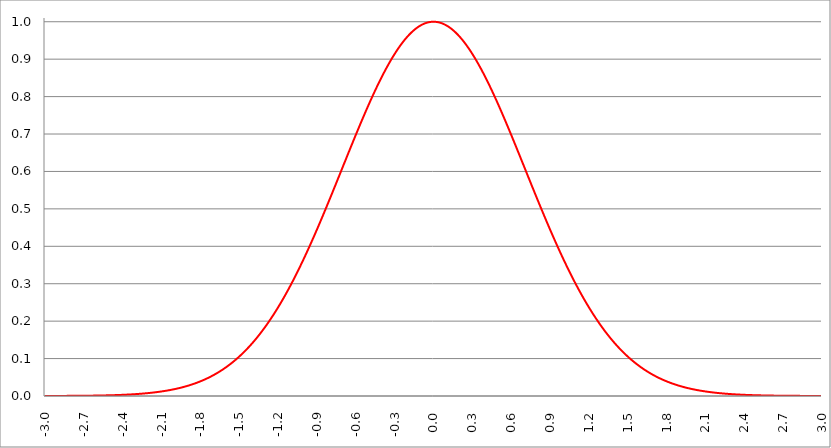
| Category | Series 1 | Series 0 | Series 2 |
|---|---|---|---|
| -3.0 | 0 |  |  |
| -2.997 | 0 |  |  |
| -2.994 | 0 |  |  |
| -2.991 | 0 |  |  |
| -2.988 | 0 |  |  |
| -2.984999999999999 | 0 |  |  |
| -2.981999999999999 | 0 |  |  |
| -2.978999999999999 | 0 |  |  |
| -2.975999999999999 | 0 |  |  |
| -2.972999999999999 | 0 |  |  |
| -2.969999999999999 | 0 |  |  |
| -2.966999999999999 | 0 |  |  |
| -2.963999999999999 | 0 |  |  |
| -2.960999999999998 | 0 |  |  |
| -2.957999999999998 | 0 |  |  |
| -2.954999999999998 | 0 |  |  |
| -2.951999999999998 | 0 |  |  |
| -2.948999999999998 | 0 |  |  |
| -2.945999999999998 | 0 |  |  |
| -2.942999999999998 | 0 |  |  |
| -2.939999999999998 | 0 |  |  |
| -2.936999999999998 | 0 |  |  |
| -2.933999999999997 | 0 |  |  |
| -2.930999999999997 | 0 |  |  |
| -2.927999999999997 | 0 |  |  |
| -2.924999999999997 | 0 |  |  |
| -2.921999999999997 | 0 |  |  |
| -2.918999999999997 | 0 |  |  |
| -2.915999999999997 | 0 |  |  |
| -2.912999999999997 | 0 |  |  |
| -2.909999999999997 | 0 |  |  |
| -2.906999999999996 | 0 |  |  |
| -2.903999999999996 | 0 |  |  |
| -2.900999999999996 | 0 |  |  |
| -2.897999999999996 | 0 |  |  |
| -2.894999999999996 | 0 |  |  |
| -2.891999999999996 | 0 |  |  |
| -2.888999999999996 | 0 |  |  |
| -2.885999999999996 | 0 |  |  |
| -2.882999999999996 | 0 |  |  |
| -2.879999999999995 | 0 |  |  |
| -2.876999999999995 | 0 |  |  |
| -2.873999999999995 | 0 |  |  |
| -2.870999999999995 | 0 |  |  |
| -2.867999999999995 | 0 |  |  |
| -2.864999999999995 | 0 |  |  |
| -2.861999999999995 | 0 |  |  |
| -2.858999999999995 | 0 |  |  |
| -2.855999999999994 | 0 |  |  |
| -2.852999999999994 | 0 |  |  |
| -2.849999999999994 | 0 |  |  |
| -2.846999999999994 | 0 |  |  |
| -2.843999999999994 | 0 |  |  |
| -2.840999999999994 | 0 |  |  |
| -2.837999999999994 | 0 |  |  |
| -2.834999999999994 | 0 |  |  |
| -2.831999999999994 | 0 |  |  |
| -2.828999999999993 | 0 |  |  |
| -2.825999999999993 | 0 |  |  |
| -2.822999999999993 | 0 |  |  |
| -2.819999999999993 | 0 |  |  |
| -2.816999999999993 | 0 |  |  |
| -2.813999999999993 | 0 |  |  |
| -2.810999999999993 | 0 |  |  |
| -2.807999999999993 | 0 |  |  |
| -2.804999999999993 | 0 |  |  |
| -2.801999999999992 | 0 |  |  |
| -2.798999999999992 | 0 |  |  |
| -2.795999999999992 | 0 |  |  |
| -2.792999999999992 | 0 |  |  |
| -2.789999999999992 | 0 |  |  |
| -2.786999999999992 | 0 |  |  |
| -2.783999999999992 | 0 |  |  |
| -2.780999999999992 | 0 |  |  |
| -2.777999999999992 | 0 |  |  |
| -2.774999999999991 | 0 |  |  |
| -2.771999999999991 | 0 |  |  |
| -2.768999999999991 | 0 |  |  |
| -2.765999999999991 | 0 |  |  |
| -2.762999999999991 | 0 |  |  |
| -2.759999999999991 | 0 |  |  |
| -2.756999999999991 | 0 |  |  |
| -2.753999999999991 | 0.001 |  |  |
| -2.75099999999999 | 0.001 |  |  |
| -2.74799999999999 | 0.001 |  |  |
| -2.74499999999999 | 0.001 |  |  |
| -2.74199999999999 | 0.001 |  |  |
| -2.73899999999999 | 0.001 |  |  |
| -2.73599999999999 | 0.001 |  |  |
| -2.73299999999999 | 0.001 |  |  |
| -2.72999999999999 | 0.001 |  |  |
| -2.72699999999999 | 0.001 |  |  |
| -2.723999999999989 | 0.001 |  |  |
| -2.720999999999989 | 0.001 |  |  |
| -2.717999999999989 | 0.001 |  |  |
| -2.714999999999989 | 0.001 |  |  |
| -2.711999999999989 | 0.001 |  |  |
| -2.708999999999989 | 0.001 |  |  |
| -2.705999999999989 | 0.001 |  |  |
| -2.702999999999989 | 0.001 |  |  |
| -2.699999999999989 | 0.001 |  |  |
| -2.696999999999988 | 0.001 |  |  |
| -2.693999999999988 | 0.001 |  |  |
| -2.690999999999988 | 0.001 |  |  |
| -2.687999999999988 | 0.001 |  |  |
| -2.684999999999988 | 0.001 |  |  |
| -2.681999999999988 | 0.001 |  |  |
| -2.678999999999988 | 0.001 |  |  |
| -2.675999999999988 | 0.001 |  |  |
| -2.672999999999988 | 0.001 |  |  |
| -2.669999999999987 | 0.001 |  |  |
| -2.666999999999987 | 0.001 |  |  |
| -2.663999999999987 | 0.001 |  |  |
| -2.660999999999987 | 0.001 |  |  |
| -2.657999999999987 | 0.001 |  |  |
| -2.654999999999987 | 0.001 |  |  |
| -2.651999999999987 | 0.001 |  |  |
| -2.648999999999987 | 0.001 |  |  |
| -2.645999999999986 | 0.001 |  |  |
| -2.642999999999986 | 0.001 |  |  |
| -2.639999999999986 | 0.001 |  |  |
| -2.636999999999986 | 0.001 |  |  |
| -2.633999999999986 | 0.001 |  |  |
| -2.630999999999986 | 0.001 |  |  |
| -2.627999999999986 | 0.001 |  |  |
| -2.624999999999986 | 0.001 |  |  |
| -2.621999999999986 | 0.001 |  |  |
| -2.618999999999985 | 0.001 |  |  |
| -2.615999999999985 | 0.001 |  |  |
| -2.612999999999985 | 0.001 |  |  |
| -2.609999999999985 | 0.001 |  |  |
| -2.606999999999985 | 0.001 |  |  |
| -2.603999999999985 | 0.001 |  |  |
| -2.600999999999985 | 0.001 |  |  |
| -2.597999999999985 | 0.001 |  |  |
| -2.594999999999985 | 0.001 |  |  |
| -2.591999999999985 | 0.001 |  |  |
| -2.588999999999984 | 0.001 |  |  |
| -2.585999999999984 | 0.001 |  |  |
| -2.582999999999984 | 0.001 |  |  |
| -2.579999999999984 | 0.001 |  |  |
| -2.576999999999984 | 0.001 |  |  |
| -2.573999999999984 | 0.001 |  |  |
| -2.570999999999984 | 0.001 |  |  |
| -2.567999999999984 | 0.001 |  |  |
| -2.564999999999984 | 0.001 |  |  |
| -2.561999999999983 | 0.001 |  |  |
| -2.558999999999983 | 0.001 |  |  |
| -2.555999999999983 | 0.001 |  |  |
| -2.552999999999983 | 0.001 |  |  |
| -2.549999999999983 | 0.001 |  |  |
| -2.546999999999983 | 0.002 |  |  |
| -2.543999999999983 | 0.002 |  |  |
| -2.540999999999983 | 0.002 |  |  |
| -2.537999999999982 | 0.002 |  |  |
| -2.534999999999982 | 0.002 |  |  |
| -2.531999999999982 | 0.002 |  |  |
| -2.528999999999982 | 0.002 |  |  |
| -2.525999999999982 | 0.002 |  |  |
| -2.522999999999982 | 0.002 |  |  |
| -2.519999999999982 | 0.002 |  |  |
| -2.516999999999982 | 0.002 |  |  |
| -2.513999999999982 | 0.002 |  |  |
| -2.510999999999981 | 0.002 |  |  |
| -2.507999999999981 | 0.002 |  |  |
| -2.504999999999981 | 0.002 |  |  |
| -2.501999999999981 | 0.002 |  |  |
| -2.498999999999981 | 0.002 |  |  |
| -2.495999999999981 | 0.002 |  |  |
| -2.492999999999981 | 0.002 |  |  |
| -2.489999999999981 | 0.002 |  |  |
| -2.486999999999981 | 0.002 |  |  |
| -2.48399999999998 | 0.002 |  |  |
| -2.48099999999998 | 0.002 |  |  |
| -2.47799999999998 | 0.002 |  |  |
| -2.47499999999998 | 0.002 |  |  |
| -2.47199999999998 | 0.002 |  |  |
| -2.46899999999998 | 0.002 |  |  |
| -2.46599999999998 | 0.002 |  |  |
| -2.46299999999998 | 0.002 |  |  |
| -2.45999999999998 | 0.002 |  |  |
| -2.456999999999979 | 0.002 |  |  |
| -2.453999999999979 | 0.002 |  |  |
| -2.450999999999979 | 0.002 |  |  |
| -2.44799999999998 | 0.002 |  |  |
| -2.444999999999979 | 0.003 |  |  |
| -2.441999999999979 | 0.003 |  |  |
| -2.438999999999979 | 0.003 |  |  |
| -2.435999999999979 | 0.003 |  |  |
| -2.432999999999978 | 0.003 |  |  |
| -2.429999999999978 | 0.003 |  |  |
| -2.426999999999978 | 0.003 |  |  |
| -2.423999999999978 | 0.003 |  |  |
| -2.420999999999978 | 0.003 |  |  |
| -2.417999999999978 | 0.003 |  |  |
| -2.414999999999978 | 0.003 |  |  |
| -2.411999999999978 | 0.003 |  |  |
| -2.408999999999978 | 0.003 |  |  |
| -2.405999999999977 | 0.003 |  |  |
| -2.402999999999977 | 0.003 |  |  |
| -2.399999999999977 | 0.003 |  |  |
| -2.396999999999977 | 0.003 |  |  |
| -2.393999999999977 | 0.003 |  |  |
| -2.390999999999977 | 0.003 |  |  |
| -2.387999999999977 | 0.003 |  |  |
| -2.384999999999977 | 0.003 |  |  |
| -2.381999999999977 | 0.003 |  |  |
| -2.378999999999976 | 0.003 |  |  |
| -2.375999999999976 | 0.004 |  |  |
| -2.372999999999976 | 0.004 |  |  |
| -2.369999999999976 | 0.004 |  |  |
| -2.366999999999976 | 0.004 |  |  |
| -2.363999999999976 | 0.004 |  |  |
| -2.360999999999976 | 0.004 |  |  |
| -2.357999999999976 | 0.004 |  |  |
| -2.354999999999976 | 0.004 |  |  |
| -2.351999999999975 | 0.004 |  |  |
| -2.348999999999975 | 0.004 |  |  |
| -2.345999999999975 | 0.004 |  |  |
| -2.342999999999975 | 0.004 |  |  |
| -2.339999999999975 | 0.004 |  |  |
| -2.336999999999975 | 0.004 |  |  |
| -2.333999999999975 | 0.004 |  |  |
| -2.330999999999975 | 0.004 |  |  |
| -2.327999999999974 | 0.004 |  |  |
| -2.324999999999974 | 0.004 |  |  |
| -2.321999999999974 | 0.005 |  |  |
| -2.318999999999974 | 0.005 |  |  |
| -2.315999999999974 | 0.005 |  |  |
| -2.312999999999974 | 0.005 |  |  |
| -2.309999999999974 | 0.005 |  |  |
| -2.306999999999974 | 0.005 |  |  |
| -2.303999999999974 | 0.005 |  |  |
| -2.300999999999973 | 0.005 |  |  |
| -2.297999999999973 | 0.005 |  |  |
| -2.294999999999973 | 0.005 |  |  |
| -2.291999999999973 | 0.005 |  |  |
| -2.288999999999973 | 0.005 |  |  |
| -2.285999999999973 | 0.005 |  |  |
| -2.282999999999973 | 0.005 |  |  |
| -2.279999999999973 | 0.006 |  |  |
| -2.276999999999973 | 0.006 |  |  |
| -2.273999999999972 | 0.006 |  |  |
| -2.270999999999972 | 0.006 |  |  |
| -2.267999999999972 | 0.006 |  |  |
| -2.264999999999972 | 0.006 |  |  |
| -2.261999999999972 | 0.006 |  |  |
| -2.258999999999972 | 0.006 |  |  |
| -2.255999999999972 | 0.006 |  |  |
| -2.252999999999972 | 0.006 |  |  |
| -2.249999999999972 | 0.006 |  |  |
| -2.246999999999971 | 0.006 |  |  |
| -2.243999999999971 | 0.007 |  |  |
| -2.240999999999971 | 0.007 |  |  |
| -2.237999999999971 | 0.007 |  |  |
| -2.234999999999971 | 0.007 |  |  |
| -2.231999999999971 | 0.007 |  |  |
| -2.228999999999971 | 0.007 |  |  |
| -2.225999999999971 | 0.007 |  |  |
| -2.222999999999971 | 0.007 |  |  |
| -2.21999999999997 | 0.007 |  |  |
| -2.21699999999997 | 0.007 |  |  |
| -2.21399999999997 | 0.007 |  |  |
| -2.21099999999997 | 0.008 |  |  |
| -2.20799999999997 | 0.008 |  |  |
| -2.20499999999997 | 0.008 |  |  |
| -2.20199999999997 | 0.008 |  |  |
| -2.19899999999997 | 0.008 |  |  |
| -2.19599999999997 | 0.008 |  |  |
| -2.192999999999969 | 0.008 |  |  |
| -2.189999999999969 | 0.008 |  |  |
| -2.186999999999969 | 0.008 |  |  |
| -2.18399999999997 | 0.008 |  |  |
| -2.180999999999969 | 0.009 |  |  |
| -2.177999999999969 | 0.009 |  |  |
| -2.174999999999969 | 0.009 |  |  |
| -2.171999999999969 | 0.009 |  |  |
| -2.168999999999968 | 0.009 |  |  |
| -2.165999999999968 | 0.009 |  |  |
| -2.162999999999968 | 0.009 |  |  |
| -2.159999999999968 | 0.009 |  |  |
| -2.156999999999968 | 0.01 |  |  |
| -2.153999999999968 | 0.01 |  |  |
| -2.150999999999968 | 0.01 |  |  |
| -2.147999999999968 | 0.01 |  |  |
| -2.144999999999968 | 0.01 |  |  |
| -2.141999999999967 | 0.01 |  |  |
| -2.138999999999967 | 0.01 |  |  |
| -2.135999999999967 | 0.01 |  |  |
| -2.132999999999967 | 0.011 |  |  |
| -2.129999999999967 | 0.011 |  |  |
| -2.126999999999967 | 0.011 |  |  |
| -2.123999999999967 | 0.011 |  |  |
| -2.120999999999967 | 0.011 |  |  |
| -2.117999999999967 | 0.011 |  |  |
| -2.114999999999966 | 0.011 |  |  |
| -2.111999999999966 | 0.012 |  |  |
| -2.108999999999966 | 0.012 |  |  |
| -2.105999999999966 | 0.012 |  |  |
| -2.102999999999966 | 0.012 |  |  |
| -2.099999999999966 | 0.012 |  |  |
| -2.096999999999966 | 0.012 |  |  |
| -2.093999999999966 | 0.012 |  |  |
| -2.090999999999966 | 0.013 |  |  |
| -2.087999999999965 | 0.013 |  |  |
| -2.084999999999965 | 0.013 |  |  |
| -2.081999999999965 | 0.013 |  |  |
| -2.078999999999965 | 0.013 |  |  |
| -2.075999999999965 | 0.013 |  |  |
| -2.072999999999965 | 0.014 |  |  |
| -2.069999999999965 | 0.014 |  |  |
| -2.066999999999965 | 0.014 |  |  |
| -2.063999999999965 | 0.014 |  |  |
| -2.060999999999964 | 0.014 |  |  |
| -2.057999999999964 | 0.014 |  |  |
| -2.054999999999964 | 0.015 |  |  |
| -2.051999999999964 | 0.015 |  |  |
| -2.048999999999964 | 0.015 |  |  |
| -2.045999999999964 | 0.015 |  |  |
| -2.042999999999964 | 0.015 |  |  |
| -2.039999999999964 | 0.016 |  |  |
| -2.036999999999963 | 0.016 |  |  |
| -2.033999999999963 | 0.016 |  |  |
| -2.030999999999963 | 0.016 |  |  |
| -2.027999999999963 | 0.016 |  |  |
| -2.024999999999963 | 0.017 |  |  |
| -2.021999999999963 | 0.017 |  |  |
| -2.018999999999963 | 0.017 |  |  |
| -2.015999999999963 | 0.017 |  |  |
| -2.012999999999963 | 0.017 |  |  |
| -2.009999999999962 | 0.018 |  |  |
| -2.006999999999962 | 0.018 |  |  |
| -2.003999999999962 | 0.018 |  |  |
| -2.000999999999962 | 0.018 |  |  |
| -1.997999999999962 | 0.018 |  |  |
| -1.994999999999962 | 0.019 |  |  |
| -1.991999999999962 | 0.019 |  |  |
| -1.988999999999963 | 0.019 |  |  |
| -1.985999999999963 | 0.019 |  |  |
| -1.982999999999963 | 0.02 |  |  |
| -1.979999999999963 | 0.02 |  |  |
| -1.976999999999963 | 0.02 |  |  |
| -1.973999999999963 | 0.02 |  |  |
| -1.970999999999963 | 0.021 |  |  |
| -1.967999999999963 | 0.021 |  |  |
| -1.964999999999963 | 0.021 |  |  |
| -1.961999999999964 | 0.021 |  |  |
| -1.958999999999964 | 0.022 |  |  |
| -1.955999999999964 | 0.022 |  |  |
| -1.952999999999964 | 0.022 |  |  |
| -1.949999999999964 | 0.022 |  |  |
| -1.946999999999964 | 0.023 |  |  |
| -1.943999999999964 | 0.023 |  |  |
| -1.940999999999964 | 0.023 |  |  |
| -1.937999999999964 | 0.023 |  |  |
| -1.934999999999964 | 0.024 |  |  |
| -1.931999999999965 | 0.024 |  |  |
| -1.928999999999965 | 0.024 |  |  |
| -1.925999999999965 | 0.024 |  |  |
| -1.922999999999965 | 0.025 |  |  |
| -1.919999999999965 | 0.025 |  |  |
| -1.916999999999965 | 0.025 |  |  |
| -1.913999999999965 | 0.026 |  |  |
| -1.910999999999965 | 0.026 |  |  |
| -1.907999999999965 | 0.026 |  |  |
| -1.904999999999966 | 0.027 |  |  |
| -1.901999999999966 | 0.027 |  |  |
| -1.898999999999966 | 0.027 |  |  |
| -1.895999999999966 | 0.027 |  |  |
| -1.892999999999966 | 0.028 |  |  |
| -1.889999999999966 | 0.028 |  |  |
| -1.886999999999966 | 0.028 |  |  |
| -1.883999999999966 | 0.029 |  |  |
| -1.880999999999966 | 0.029 |  |  |
| -1.877999999999967 | 0.029 |  |  |
| -1.874999999999967 | 0.03 |  |  |
| -1.871999999999967 | 0.03 |  |  |
| -1.868999999999967 | 0.03 |  |  |
| -1.865999999999967 | 0.031 |  |  |
| -1.862999999999967 | 0.031 |  |  |
| -1.859999999999967 | 0.031 |  |  |
| -1.856999999999967 | 0.032 |  |  |
| -1.853999999999967 | 0.032 |  |  |
| -1.850999999999968 | 0.033 |  |  |
| -1.847999999999968 | 0.033 |  |  |
| -1.844999999999968 | 0.033 |  |  |
| -1.841999999999968 | 0.034 |  |  |
| -1.838999999999968 | 0.034 |  |  |
| -1.835999999999968 | 0.034 |  |  |
| -1.832999999999968 | 0.035 |  |  |
| -1.829999999999968 | 0.035 |  |  |
| -1.826999999999968 | 0.036 |  |  |
| -1.823999999999968 | 0.036 |  |  |
| -1.820999999999969 | 0.036 |  |  |
| -1.817999999999969 | 0.037 |  |  |
| -1.814999999999969 | 0.037 |  |  |
| -1.811999999999969 | 0.038 |  |  |
| -1.808999999999969 | 0.038 |  |  |
| -1.805999999999969 | 0.038 |  |  |
| -1.802999999999969 | 0.039 |  |  |
| -1.799999999999969 | 0.039 |  |  |
| -1.796999999999969 | 0.04 |  |  |
| -1.79399999999997 | 0.04 |  |  |
| -1.79099999999997 | 0.04 |  |  |
| -1.78799999999997 | 0.041 |  |  |
| -1.78499999999997 | 0.041 |  |  |
| -1.78199999999997 | 0.042 |  |  |
| -1.77899999999997 | 0.042 |  |  |
| -1.77599999999997 | 0.043 |  |  |
| -1.77299999999997 | 0.043 |  |  |
| -1.76999999999997 | 0.044 |  |  |
| -1.766999999999971 | 0.044 |  |  |
| -1.763999999999971 | 0.045 |  |  |
| -1.760999999999971 | 0.045 |  |  |
| -1.757999999999971 | 0.045 |  |  |
| -1.754999999999971 | 0.046 |  |  |
| -1.751999999999971 | 0.046 |  |  |
| -1.748999999999971 | 0.047 |  |  |
| -1.745999999999971 | 0.047 |  |  |
| -1.742999999999971 | 0.048 |  |  |
| -1.739999999999971 | 0.048 |  |  |
| -1.736999999999972 | 0.049 |  |  |
| -1.733999999999972 | 0.049 |  |  |
| -1.730999999999972 | 0.05 |  |  |
| -1.727999999999972 | 0.05 |  |  |
| -1.724999999999972 | 0.051 |  |  |
| -1.721999999999972 | 0.052 |  |  |
| -1.718999999999972 | 0.052 |  |  |
| -1.715999999999972 | 0.053 |  |  |
| -1.712999999999972 | 0.053 |  |  |
| -1.709999999999973 | 0.054 |  |  |
| -1.706999999999973 | 0.054 |  |  |
| -1.703999999999973 | 0.055 |  |  |
| -1.700999999999973 | 0.055 |  |  |
| -1.697999999999973 | 0.056 |  |  |
| -1.694999999999973 | 0.057 |  |  |
| -1.691999999999973 | 0.057 |  |  |
| -1.688999999999973 | 0.058 |  |  |
| -1.685999999999973 | 0.058 |  |  |
| -1.682999999999974 | 0.059 |  |  |
| -1.679999999999974 | 0.059 |  |  |
| -1.676999999999974 | 0.06 |  |  |
| -1.673999999999974 | 0.061 |  |  |
| -1.670999999999974 | 0.061 |  |  |
| -1.667999999999974 | 0.062 |  |  |
| -1.664999999999974 | 0.063 |  |  |
| -1.661999999999974 | 0.063 |  |  |
| -1.658999999999974 | 0.064 |  |  |
| -1.655999999999975 | 0.064 |  |  |
| -1.652999999999975 | 0.065 |  |  |
| -1.649999999999975 | 0.066 |  |  |
| -1.646999999999975 | 0.066 |  |  |
| -1.643999999999975 | 0.067 |  |  |
| -1.640999999999975 | 0.068 |  |  |
| -1.637999999999975 | 0.068 |  |  |
| -1.634999999999975 | 0.069 |  |  |
| -1.631999999999975 | 0.07 |  |  |
| -1.628999999999975 | 0.07 |  |  |
| -1.625999999999976 | 0.071 |  |  |
| -1.622999999999976 | 0.072 |  |  |
| -1.619999999999976 | 0.072 |  |  |
| -1.616999999999976 | 0.073 |  |  |
| -1.613999999999976 | 0.074 |  |  |
| -1.610999999999976 | 0.075 |  |  |
| -1.607999999999976 | 0.075 |  |  |
| -1.604999999999976 | 0.076 |  |  |
| -1.601999999999976 | 0.077 |  |  |
| -1.598999999999977 | 0.078 |  |  |
| -1.595999999999977 | 0.078 |  |  |
| -1.592999999999977 | 0.079 |  |  |
| -1.589999999999977 | 0.08 |  |  |
| -1.586999999999977 | 0.081 |  |  |
| -1.583999999999977 | 0.081 |  |  |
| -1.580999999999977 | 0.082 |  |  |
| -1.577999999999977 | 0.083 |  |  |
| -1.574999999999978 | 0.084 |  |  |
| -1.571999999999978 | 0.084 |  |  |
| -1.568999999999978 | 0.085 |  |  |
| -1.565999999999978 | 0.086 |  |  |
| -1.562999999999978 | 0.087 |  |  |
| -1.559999999999978 | 0.088 |  |  |
| -1.556999999999978 | 0.089 |  |  |
| -1.553999999999978 | 0.089 |  |  |
| -1.550999999999978 | 0.09 |  |  |
| -1.547999999999978 | 0.091 |  |  |
| -1.544999999999979 | 0.092 |  |  |
| -1.541999999999979 | 0.093 |  |  |
| -1.538999999999979 | 0.094 |  |  |
| -1.535999999999979 | 0.094 |  |  |
| -1.532999999999979 | 0.095 |  |  |
| -1.529999999999979 | 0.096 |  |  |
| -1.526999999999979 | 0.097 |  |  |
| -1.523999999999979 | 0.098 |  |  |
| -1.520999999999979 | 0.099 |  |  |
| -1.51799999999998 | 0.1 |  |  |
| -1.51499999999998 | 0.101 |  |  |
| -1.51199999999998 | 0.102 |  |  |
| -1.50899999999998 | 0.103 |  |  |
| -1.50599999999998 | 0.104 |  |  |
| -1.50299999999998 | 0.104 |  |  |
| -1.49999999999998 | 0.105 |  |  |
| -1.49699999999998 | 0.106 |  |  |
| -1.49399999999998 | 0.107 |  |  |
| -1.490999999999981 | 0.108 |  |  |
| -1.487999999999981 | 0.109 |  |  |
| -1.484999999999981 | 0.11 |  |  |
| -1.481999999999981 | 0.111 |  |  |
| -1.478999999999981 | 0.112 |  |  |
| -1.475999999999981 | 0.113 |  |  |
| -1.472999999999981 | 0.114 |  |  |
| -1.469999999999981 | 0.115 |  |  |
| -1.466999999999981 | 0.116 |  |  |
| -1.463999999999982 | 0.117 |  |  |
| -1.460999999999982 | 0.118 |  |  |
| -1.457999999999982 | 0.119 |  |  |
| -1.454999999999982 | 0.12 |  |  |
| -1.451999999999982 | 0.121 |  |  |
| -1.448999999999982 | 0.123 |  |  |
| -1.445999999999982 | 0.124 |  |  |
| -1.442999999999982 | 0.125 |  |  |
| -1.439999999999982 | 0.126 |  |  |
| -1.436999999999982 | 0.127 |  |  |
| -1.433999999999983 | 0.128 |  |  |
| -1.430999999999983 | 0.129 |  |  |
| -1.427999999999983 | 0.13 |  |  |
| -1.424999999999983 | 0.131 |  |  |
| -1.421999999999983 | 0.132 |  |  |
| -1.418999999999983 | 0.134 |  |  |
| -1.415999999999983 | 0.135 |  |  |
| -1.412999999999983 | 0.136 |  |  |
| -1.409999999999983 | 0.137 |  |  |
| -1.406999999999984 | 0.138 |  |  |
| -1.403999999999984 | 0.139 |  |  |
| -1.400999999999984 | 0.14 |  |  |
| -1.397999999999984 | 0.142 |  |  |
| -1.394999999999984 | 0.143 |  |  |
| -1.391999999999984 | 0.144 |  |  |
| -1.388999999999984 | 0.145 |  |  |
| -1.385999999999984 | 0.146 |  |  |
| -1.382999999999984 | 0.148 |  |  |
| -1.379999999999985 | 0.149 |  |  |
| -1.376999999999985 | 0.15 |  |  |
| -1.373999999999985 | 0.151 |  |  |
| -1.370999999999985 | 0.153 |  |  |
| -1.367999999999985 | 0.154 |  |  |
| -1.364999999999985 | 0.155 |  |  |
| -1.361999999999985 | 0.156 |  |  |
| -1.358999999999985 | 0.158 |  |  |
| -1.355999999999985 | 0.159 |  |  |
| -1.352999999999985 | 0.16 |  |  |
| -1.349999999999986 | 0.162 |  |  |
| -1.346999999999986 | 0.163 |  |  |
| -1.343999999999986 | 0.164 |  |  |
| -1.340999999999986 | 0.166 |  |  |
| -1.337999999999986 | 0.167 |  |  |
| -1.334999999999986 | 0.168 |  |  |
| -1.331999999999986 | 0.17 |  |  |
| -1.328999999999986 | 0.171 |  |  |
| -1.325999999999986 | 0.172 |  |  |
| -1.322999999999987 | 0.174 |  |  |
| -1.319999999999987 | 0.175 |  |  |
| -1.316999999999987 | 0.176 |  |  |
| -1.313999999999987 | 0.178 |  |  |
| -1.310999999999987 | 0.179 |  |  |
| -1.307999999999987 | 0.181 |  |  |
| -1.304999999999987 | 0.182 |  |  |
| -1.301999999999987 | 0.184 |  |  |
| -1.298999999999987 | 0.185 |  |  |
| -1.295999999999988 | 0.186 |  |  |
| -1.292999999999988 | 0.188 |  |  |
| -1.289999999999988 | 0.189 |  |  |
| -1.286999999999988 | 0.191 |  |  |
| -1.283999999999988 | 0.192 |  |  |
| -1.280999999999988 | 0.194 |  |  |
| -1.277999999999988 | 0.195 |  |  |
| -1.274999999999988 | 0.197 |  |  |
| -1.271999999999988 | 0.198 |  |  |
| -1.268999999999989 | 0.2 |  |  |
| -1.265999999999989 | 0.201 |  |  |
| -1.262999999999989 | 0.203 |  |  |
| -1.259999999999989 | 0.204 |  |  |
| -1.256999999999989 | 0.206 |  |  |
| -1.253999999999989 | 0.208 |  |  |
| -1.250999999999989 | 0.209 |  |  |
| -1.247999999999989 | 0.211 |  |  |
| -1.244999999999989 | 0.212 |  |  |
| -1.24199999999999 | 0.214 |  |  |
| -1.23899999999999 | 0.215 |  |  |
| -1.23599999999999 | 0.217 |  |  |
| -1.23299999999999 | 0.219 |  |  |
| -1.22999999999999 | 0.22 |  |  |
| -1.22699999999999 | 0.222 |  |  |
| -1.22399999999999 | 0.224 |  |  |
| -1.22099999999999 | 0.225 |  |  |
| -1.21799999999999 | 0.227 |  |  |
| -1.214999999999991 | 0.228 |  |  |
| -1.211999999999991 | 0.23 |  |  |
| -1.208999999999991 | 0.232 |  |  |
| -1.205999999999991 | 0.234 |  |  |
| -1.202999999999991 | 0.235 |  |  |
| -1.199999999999991 | 0.237 |  |  |
| -1.196999999999991 | 0.239 |  |  |
| -1.193999999999991 | 0.24 |  |  |
| -1.190999999999991 | 0.242 |  |  |
| -1.187999999999991 | 0.244 |  |  |
| -1.184999999999992 | 0.246 |  |  |
| -1.181999999999992 | 0.247 |  |  |
| -1.178999999999992 | 0.249 |  |  |
| -1.175999999999992 | 0.251 |  |  |
| -1.172999999999992 | 0.253 |  |  |
| -1.169999999999992 | 0.254 |  |  |
| -1.166999999999992 | 0.256 |  |  |
| -1.163999999999992 | 0.258 |  |  |
| -1.160999999999992 | 0.26 |  |  |
| -1.157999999999993 | 0.262 |  |  |
| -1.154999999999993 | 0.263 |  |  |
| -1.151999999999993 | 0.265 |  |  |
| -1.148999999999993 | 0.267 |  |  |
| -1.145999999999993 | 0.269 |  |  |
| -1.142999999999993 | 0.271 |  |  |
| -1.139999999999993 | 0.273 |  |  |
| -1.136999999999993 | 0.275 |  |  |
| -1.133999999999993 | 0.276 |  |  |
| -1.130999999999994 | 0.278 |  |  |
| -1.127999999999994 | 0.28 |  |  |
| -1.124999999999994 | 0.282 |  |  |
| -1.121999999999994 | 0.284 |  |  |
| -1.118999999999994 | 0.286 |  |  |
| -1.115999999999994 | 0.288 |  |  |
| -1.112999999999994 | 0.29 |  |  |
| -1.109999999999994 | 0.292 |  |  |
| -1.106999999999994 | 0.294 |  |  |
| -1.103999999999995 | 0.296 |  |  |
| -1.100999999999995 | 0.298 |  |  |
| -1.097999999999995 | 0.3 |  |  |
| -1.094999999999995 | 0.301 |  |  |
| -1.091999999999995 | 0.303 |  |  |
| -1.088999999999995 | 0.305 |  |  |
| -1.085999999999995 | 0.307 |  |  |
| -1.082999999999995 | 0.309 |  |  |
| -1.079999999999995 | 0.311 |  |  |
| -1.076999999999996 | 0.314 |  |  |
| -1.073999999999996 | 0.316 |  |  |
| -1.070999999999996 | 0.318 |  |  |
| -1.067999999999996 | 0.32 |  |  |
| -1.064999999999996 | 0.322 |  |  |
| -1.061999999999996 | 0.324 |  |  |
| -1.058999999999996 | 0.326 |  |  |
| -1.055999999999996 | 0.328 |  |  |
| -1.052999999999996 | 0.33 |  |  |
| -1.049999999999996 | 0.332 |  |  |
| -1.046999999999997 | 0.334 |  |  |
| -1.043999999999997 | 0.336 |  |  |
| -1.040999999999997 | 0.338 |  |  |
| -1.037999999999997 | 0.34 |  |  |
| -1.034999999999997 | 0.343 |  |  |
| -1.031999999999997 | 0.345 |  |  |
| -1.028999999999997 | 0.347 |  |  |
| -1.025999999999997 | 0.349 |  |  |
| -1.022999999999997 | 0.351 |  |  |
| -1.019999999999998 | 0.353 |  |  |
| -1.016999999999998 | 0.355 |  |  |
| -1.013999999999998 | 0.358 |  |  |
| -1.010999999999998 | 0.36 |  |  |
| -1.007999999999998 | 0.362 |  |  |
| -1.004999999999998 | 0.364 |  |  |
| -1.001999999999998 | 0.366 |  |  |
| -0.998999999999998 | 0.369 |  |  |
| -0.995999999999998 | 0.371 |  |  |
| -0.992999999999998 | 0.373 |  |  |
| -0.989999999999998 | 0.375 |  |  |
| -0.986999999999998 | 0.378 |  |  |
| -0.983999999999998 | 0.38 |  |  |
| -0.980999999999998 | 0.382 |  |  |
| -0.977999999999998 | 0.384 |  |  |
| -0.974999999999998 | 0.386 |  |  |
| -0.971999999999998 | 0.389 |  |  |
| -0.968999999999998 | 0.391 |  |  |
| -0.965999999999998 | 0.393 |  |  |
| -0.962999999999998 | 0.396 |  |  |
| -0.959999999999998 | 0.398 |  |  |
| -0.956999999999998 | 0.4 |  |  |
| -0.953999999999998 | 0.402 |  |  |
| -0.950999999999998 | 0.405 |  |  |
| -0.947999999999998 | 0.407 |  |  |
| -0.944999999999998 | 0.409 |  |  |
| -0.941999999999998 | 0.412 |  |  |
| -0.938999999999998 | 0.414 |  |  |
| -0.935999999999998 | 0.416 |  |  |
| -0.932999999999998 | 0.419 |  |  |
| -0.929999999999998 | 0.421 |  |  |
| -0.926999999999998 | 0.423 |  |  |
| -0.923999999999998 | 0.426 |  |  |
| -0.920999999999998 | 0.428 |  |  |
| -0.917999999999998 | 0.431 |  |  |
| -0.914999999999998 | 0.433 |  |  |
| -0.911999999999998 | 0.435 |  |  |
| -0.908999999999998 | 0.438 |  |  |
| -0.905999999999998 | 0.44 |  |  |
| -0.902999999999998 | 0.442 |  |  |
| -0.899999999999998 | 0.445 |  |  |
| -0.896999999999998 | 0.447 |  |  |
| -0.893999999999998 | 0.45 |  |  |
| -0.890999999999998 | 0.452 |  |  |
| -0.887999999999998 | 0.455 |  |  |
| -0.884999999999998 | 0.457 |  |  |
| -0.881999999999998 | 0.459 |  |  |
| -0.878999999999998 | 0.462 |  |  |
| -0.875999999999998 | 0.464 |  |  |
| -0.872999999999998 | 0.467 |  |  |
| -0.869999999999998 | 0.469 |  |  |
| -0.866999999999998 | 0.472 |  |  |
| -0.863999999999998 | 0.474 |  |  |
| -0.860999999999998 | 0.476 |  |  |
| -0.857999999999998 | 0.479 |  |  |
| -0.854999999999998 | 0.481 |  |  |
| -0.851999999999998 | 0.484 |  |  |
| -0.848999999999998 | 0.486 |  |  |
| -0.845999999999998 | 0.489 |  |  |
| -0.842999999999998 | 0.491 |  |  |
| -0.839999999999998 | 0.494 |  |  |
| -0.836999999999998 | 0.496 |  |  |
| -0.833999999999998 | 0.499 |  |  |
| -0.830999999999998 | 0.501 |  |  |
| -0.827999999999998 | 0.504 |  |  |
| -0.824999999999998 | 0.506 |  |  |
| -0.821999999999998 | 0.509 |  |  |
| -0.818999999999998 | 0.511 |  |  |
| -0.815999999999998 | 0.514 |  |  |
| -0.812999999999998 | 0.516 |  |  |
| -0.809999999999998 | 0.519 |  |  |
| -0.806999999999998 | 0.521 |  |  |
| -0.803999999999998 | 0.524 |  |  |
| -0.800999999999998 | 0.526 |  |  |
| -0.797999999999998 | 0.529 |  |  |
| -0.794999999999998 | 0.532 |  |  |
| -0.791999999999998 | 0.534 |  |  |
| -0.788999999999998 | 0.537 |  |  |
| -0.785999999999998 | 0.539 |  |  |
| -0.782999999999998 | 0.542 |  |  |
| -0.779999999999998 | 0.544 |  |  |
| -0.776999999999998 | 0.547 |  |  |
| -0.773999999999998 | 0.549 |  |  |
| -0.770999999999998 | 0.552 |  |  |
| -0.767999999999998 | 0.554 |  |  |
| -0.764999999999998 | 0.557 |  |  |
| -0.761999999999998 | 0.56 |  |  |
| -0.758999999999998 | 0.562 |  |  |
| -0.755999999999998 | 0.565 |  |  |
| -0.752999999999998 | 0.567 |  |  |
| -0.749999999999998 | 0.57 |  |  |
| -0.746999999999998 | 0.572 |  |  |
| -0.743999999999998 | 0.575 |  |  |
| -0.740999999999998 | 0.577 |  |  |
| -0.737999999999998 | 0.58 |  |  |
| -0.734999999999998 | 0.583 |  |  |
| -0.731999999999998 | 0.585 |  |  |
| -0.728999999999998 | 0.588 |  |  |
| -0.725999999999998 | 0.59 |  |  |
| -0.722999999999998 | 0.593 |  |  |
| -0.719999999999998 | 0.595 |  |  |
| -0.716999999999998 | 0.598 |  |  |
| -0.713999999999998 | 0.601 |  |  |
| -0.710999999999998 | 0.603 |  |  |
| -0.707999999999998 | 0.606 |  |  |
| -0.704999999999998 | 0.608 |  |  |
| -0.701999999999998 | 0.611 |  |  |
| -0.698999999999998 | 0.613 |  |  |
| -0.695999999999998 | 0.616 |  |  |
| -0.692999999999998 | 0.619 |  |  |
| -0.689999999999998 | 0.621 |  |  |
| -0.686999999999998 | 0.624 |  |  |
| -0.683999999999998 | 0.626 |  |  |
| -0.680999999999998 | 0.629 |  |  |
| -0.677999999999998 | 0.631 |  |  |
| -0.674999999999998 | 0.634 |  |  |
| -0.671999999999998 | 0.637 |  |  |
| -0.668999999999998 | 0.639 |  |  |
| -0.665999999999998 | 0.642 |  |  |
| -0.662999999999998 | 0.644 |  |  |
| -0.659999999999998 | 0.647 |  |  |
| -0.656999999999998 | 0.649 |  |  |
| -0.653999999999998 | 0.652 |  |  |
| -0.650999999999998 | 0.655 |  |  |
| -0.647999999999998 | 0.657 |  |  |
| -0.644999999999998 | 0.66 |  |  |
| -0.641999999999998 | 0.662 |  |  |
| -0.638999999999998 | 0.665 |  |  |
| -0.635999999999998 | 0.667 |  |  |
| -0.632999999999998 | 0.67 |  |  |
| -0.629999999999998 | 0.672 |  |  |
| -0.626999999999998 | 0.675 |  |  |
| -0.623999999999998 | 0.677 |  |  |
| -0.620999999999998 | 0.68 |  |  |
| -0.617999999999998 | 0.683 |  |  |
| -0.614999999999998 | 0.685 |  |  |
| -0.611999999999998 | 0.688 |  |  |
| -0.608999999999998 | 0.69 |  |  |
| -0.605999999999998 | 0.693 |  |  |
| -0.602999999999998 | 0.695 |  |  |
| -0.599999999999998 | 0.698 |  |  |
| -0.596999999999998 | 0.7 |  |  |
| -0.593999999999998 | 0.703 |  |  |
| -0.590999999999998 | 0.705 |  |  |
| -0.587999999999998 | 0.708 |  |  |
| -0.584999999999998 | 0.71 |  |  |
| -0.581999999999998 | 0.713 |  |  |
| -0.578999999999998 | 0.715 |  |  |
| -0.575999999999998 | 0.718 |  |  |
| -0.572999999999998 | 0.72 |  |  |
| -0.569999999999998 | 0.723 |  |  |
| -0.566999999999998 | 0.725 |  |  |
| -0.563999999999998 | 0.728 |  |  |
| -0.560999999999998 | 0.73 |  |  |
| -0.557999999999998 | 0.732 |  |  |
| -0.554999999999998 | 0.735 |  |  |
| -0.551999999999998 | 0.737 |  |  |
| -0.548999999999998 | 0.74 |  |  |
| -0.545999999999998 | 0.742 |  |  |
| -0.542999999999998 | 0.745 |  |  |
| -0.539999999999998 | 0.747 |  |  |
| -0.536999999999998 | 0.749 |  |  |
| -0.533999999999998 | 0.752 |  |  |
| -0.530999999999998 | 0.754 |  |  |
| -0.527999999999998 | 0.757 |  |  |
| -0.524999999999998 | 0.759 |  |  |
| -0.521999999999998 | 0.761 |  |  |
| -0.518999999999998 | 0.764 |  |  |
| -0.515999999999998 | 0.766 |  |  |
| -0.512999999999998 | 0.769 |  |  |
| -0.509999999999998 | 0.771 |  |  |
| -0.506999999999998 | 0.773 |  |  |
| -0.503999999999998 | 0.776 |  |  |
| -0.500999999999998 | 0.778 |  |  |
| -0.497999999999998 | 0.78 |  |  |
| -0.494999999999998 | 0.783 |  |  |
| -0.491999999999998 | 0.785 |  |  |
| -0.488999999999998 | 0.787 |  |  |
| -0.485999999999998 | 0.79 |  |  |
| -0.482999999999998 | 0.792 |  |  |
| -0.479999999999998 | 0.794 |  |  |
| -0.476999999999998 | 0.796 |  |  |
| -0.473999999999998 | 0.799 |  |  |
| -0.470999999999998 | 0.801 |  |  |
| -0.467999999999998 | 0.803 |  |  |
| -0.464999999999998 | 0.806 |  |  |
| -0.461999999999998 | 0.808 |  |  |
| -0.458999999999998 | 0.81 |  |  |
| -0.455999999999998 | 0.812 |  |  |
| -0.452999999999998 | 0.814 |  |  |
| -0.449999999999998 | 0.817 |  |  |
| -0.446999999999998 | 0.819 |  |  |
| -0.443999999999998 | 0.821 |  |  |
| -0.440999999999998 | 0.823 |  |  |
| -0.437999999999998 | 0.825 |  |  |
| -0.434999999999998 | 0.828 |  |  |
| -0.431999999999998 | 0.83 |  |  |
| -0.428999999999998 | 0.832 |  |  |
| -0.425999999999998 | 0.834 |  |  |
| -0.422999999999998 | 0.836 |  |  |
| -0.419999999999998 | 0.838 |  |  |
| -0.416999999999998 | 0.84 |  |  |
| -0.413999999999998 | 0.842 |  |  |
| -0.410999999999998 | 0.845 |  |  |
| -0.407999999999998 | 0.847 |  |  |
| -0.404999999999998 | 0.849 |  |  |
| -0.401999999999998 | 0.851 |  |  |
| -0.398999999999998 | 0.853 |  |  |
| -0.395999999999998 | 0.855 |  |  |
| -0.392999999999998 | 0.857 |  |  |
| -0.389999999999998 | 0.859 |  |  |
| -0.386999999999998 | 0.861 |  |  |
| -0.383999999999998 | 0.863 |  |  |
| -0.380999999999998 | 0.865 |  |  |
| -0.377999999999998 | 0.867 |  |  |
| -0.374999999999998 | 0.869 |  |  |
| -0.371999999999998 | 0.871 |  |  |
| -0.368999999999998 | 0.873 |  |  |
| -0.365999999999998 | 0.875 |  |  |
| -0.362999999999998 | 0.877 |  |  |
| -0.359999999999998 | 0.878 |  |  |
| -0.356999999999998 | 0.88 |  |  |
| -0.353999999999998 | 0.882 |  |  |
| -0.350999999999998 | 0.884 |  |  |
| -0.347999999999998 | 0.886 |  |  |
| -0.344999999999998 | 0.888 |  |  |
| -0.341999999999998 | 0.89 |  |  |
| -0.338999999999998 | 0.891 |  |  |
| -0.335999999999998 | 0.893 |  |  |
| -0.332999999999998 | 0.895 |  |  |
| -0.329999999999998 | 0.897 |  |  |
| -0.326999999999998 | 0.899 |  |  |
| -0.323999999999998 | 0.9 |  |  |
| -0.320999999999998 | 0.902 |  |  |
| -0.317999999999998 | 0.904 |  |  |
| -0.314999999999998 | 0.906 |  |  |
| -0.311999999999998 | 0.907 |  |  |
| -0.308999999999998 | 0.909 |  |  |
| -0.305999999999998 | 0.911 |  |  |
| -0.302999999999998 | 0.912 |  |  |
| -0.299999999999998 | 0.914 |  |  |
| -0.296999999999998 | 0.916 |  |  |
| -0.293999999999998 | 0.917 |  |  |
| -0.290999999999998 | 0.919 |  |  |
| -0.287999999999998 | 0.92 |  |  |
| -0.284999999999998 | 0.922 |  |  |
| -0.281999999999998 | 0.924 |  |  |
| -0.278999999999998 | 0.925 |  |  |
| -0.275999999999998 | 0.927 |  |  |
| -0.272999999999998 | 0.928 |  |  |
| -0.269999999999998 | 0.93 |  |  |
| -0.266999999999998 | 0.931 |  |  |
| -0.263999999999998 | 0.933 |  |  |
| -0.260999999999998 | 0.934 |  |  |
| -0.257999999999998 | 0.936 |  |  |
| -0.254999999999998 | 0.937 |  |  |
| -0.251999999999998 | 0.938 |  |  |
| -0.248999999999998 | 0.94 |  |  |
| -0.245999999999998 | 0.941 |  |  |
| -0.242999999999998 | 0.943 |  |  |
| -0.239999999999998 | 0.944 |  |  |
| -0.236999999999998 | 0.945 |  |  |
| -0.233999999999998 | 0.947 |  |  |
| -0.230999999999998 | 0.948 |  |  |
| -0.227999999999998 | 0.949 |  |  |
| -0.224999999999998 | 0.951 |  |  |
| -0.221999999999998 | 0.952 |  |  |
| -0.218999999999998 | 0.953 |  |  |
| -0.215999999999998 | 0.954 |  |  |
| -0.212999999999998 | 0.956 |  |  |
| -0.209999999999998 | 0.957 |  |  |
| -0.206999999999998 | 0.958 |  |  |
| -0.203999999999998 | 0.959 |  |  |
| -0.200999999999998 | 0.96 |  |  |
| -0.197999999999997 | 0.962 |  |  |
| -0.194999999999997 | 0.963 |  |  |
| -0.191999999999997 | 0.964 |  |  |
| -0.188999999999997 | 0.965 |  |  |
| -0.185999999999997 | 0.966 |  |  |
| -0.182999999999997 | 0.967 |  |  |
| -0.179999999999997 | 0.968 |  |  |
| -0.176999999999997 | 0.969 |  |  |
| -0.173999999999997 | 0.97 |  |  |
| -0.170999999999997 | 0.971 |  |  |
| -0.167999999999997 | 0.972 |  |  |
| -0.164999999999997 | 0.973 |  |  |
| -0.161999999999997 | 0.974 |  |  |
| -0.158999999999997 | 0.975 |  |  |
| -0.155999999999997 | 0.976 |  |  |
| -0.152999999999997 | 0.977 |  |  |
| -0.149999999999997 | 0.978 |  |  |
| -0.146999999999997 | 0.979 |  |  |
| -0.143999999999997 | 0.979 |  |  |
| -0.140999999999997 | 0.98 |  |  |
| -0.137999999999997 | 0.981 |  |  |
| -0.134999999999997 | 0.982 |  |  |
| -0.131999999999997 | 0.983 |  |  |
| -0.128999999999997 | 0.983 |  |  |
| -0.125999999999997 | 0.984 |  |  |
| -0.122999999999997 | 0.985 |  |  |
| -0.119999999999997 | 0.986 |  |  |
| -0.116999999999997 | 0.986 |  |  |
| -0.113999999999997 | 0.987 |  |  |
| -0.110999999999997 | 0.988 |  |  |
| -0.107999999999997 | 0.988 |  |  |
| -0.104999999999997 | 0.989 |  |  |
| -0.101999999999997 | 0.99 |  |  |
| -0.0989999999999974 | 0.99 |  |  |
| -0.0959999999999974 | 0.991 |  |  |
| -0.0929999999999974 | 0.991 |  |  |
| -0.0899999999999974 | 0.992 |  |  |
| -0.0869999999999974 | 0.992 |  |  |
| -0.0839999999999974 | 0.993 |  |  |
| -0.0809999999999974 | 0.993 |  |  |
| -0.0779999999999974 | 0.994 |  |  |
| -0.0749999999999974 | 0.994 |  |  |
| -0.0719999999999974 | 0.995 |  |  |
| -0.0689999999999974 | 0.995 |  |  |
| -0.0659999999999974 | 0.996 |  |  |
| -0.0629999999999974 | 0.996 |  |  |
| -0.0599999999999974 | 0.996 |  |  |
| -0.0569999999999974 | 0.997 |  |  |
| -0.0539999999999974 | 0.997 |  |  |
| -0.0509999999999974 | 0.997 |  |  |
| -0.0479999999999974 | 0.998 |  |  |
| -0.0449999999999974 | 0.998 |  |  |
| -0.0419999999999974 | 0.998 |  |  |
| -0.0389999999999974 | 0.998 |  |  |
| -0.0359999999999974 | 0.999 |  |  |
| -0.0329999999999974 | 0.999 |  |  |
| -0.0299999999999974 | 0.999 |  |  |
| -0.0269999999999974 | 0.999 |  |  |
| -0.0239999999999974 | 0.999 |  |  |
| -0.0209999999999974 | 1 |  |  |
| -0.0179999999999974 | 1 |  |  |
| -0.0149999999999974 | 1 |  |  |
| -0.0119999999999974 | 1 |  |  |
| -0.00899999999999737 | 1 |  |  |
| -0.00599999999999737 | 1 |  |  |
| -0.00299999999999737 | 1 |  |  |
| 2.62897342784285e-15 | 1 |  |  |
| 0.00300000000000263 | 1 |  |  |
| 0.00600000000000263 | 1 |  |  |
| 0.00900000000000263 | 1 |  |  |
| 0.0120000000000026 | 1 |  |  |
| 0.0150000000000026 | 1 |  |  |
| 0.0180000000000026 | 1 |  |  |
| 0.0210000000000026 | 1 |  |  |
| 0.0240000000000026 | 0.999 |  |  |
| 0.0270000000000026 | 0.999 |  |  |
| 0.0300000000000026 | 0.999 |  |  |
| 0.0330000000000026 | 0.999 |  |  |
| 0.0360000000000026 | 0.999 |  |  |
| 0.0390000000000026 | 0.998 |  |  |
| 0.0420000000000026 | 0.998 |  |  |
| 0.0450000000000026 | 0.998 |  |  |
| 0.0480000000000026 | 0.998 |  |  |
| 0.0510000000000026 | 0.997 |  |  |
| 0.0540000000000026 | 0.997 |  |  |
| 0.0570000000000026 | 0.997 |  |  |
| 0.0600000000000026 | 0.996 |  |  |
| 0.0630000000000026 | 0.996 |  |  |
| 0.0660000000000026 | 0.996 |  |  |
| 0.0690000000000026 | 0.995 |  |  |
| 0.0720000000000027 | 0.995 |  |  |
| 0.0750000000000027 | 0.994 |  |  |
| 0.0780000000000027 | 0.994 |  |  |
| 0.0810000000000027 | 0.993 |  |  |
| 0.0840000000000027 | 0.993 |  |  |
| 0.0870000000000027 | 0.992 |  |  |
| 0.0900000000000027 | 0.992 |  |  |
| 0.0930000000000027 | 0.991 |  |  |
| 0.0960000000000027 | 0.991 |  |  |
| 0.0990000000000027 | 0.99 |  |  |
| 0.102000000000003 | 0.99 |  |  |
| 0.105000000000003 | 0.989 |  |  |
| 0.108000000000003 | 0.988 |  |  |
| 0.111000000000003 | 0.988 |  |  |
| 0.114000000000003 | 0.987 |  |  |
| 0.117000000000003 | 0.986 |  |  |
| 0.120000000000003 | 0.986 |  |  |
| 0.123000000000003 | 0.985 |  |  |
| 0.126000000000003 | 0.984 |  |  |
| 0.129000000000003 | 0.983 |  |  |
| 0.132000000000003 | 0.983 |  |  |
| 0.135000000000003 | 0.982 |  |  |
| 0.138000000000003 | 0.981 |  |  |
| 0.141000000000003 | 0.98 |  |  |
| 0.144000000000003 | 0.979 |  |  |
| 0.147000000000003 | 0.979 |  |  |
| 0.150000000000003 | 0.978 |  |  |
| 0.153000000000003 | 0.977 |  |  |
| 0.156000000000003 | 0.976 |  |  |
| 0.159000000000003 | 0.975 |  |  |
| 0.162000000000003 | 0.974 |  |  |
| 0.165000000000003 | 0.973 |  |  |
| 0.168000000000003 | 0.972 |  |  |
| 0.171000000000003 | 0.971 |  |  |
| 0.174000000000003 | 0.97 |  |  |
| 0.177000000000003 | 0.969 |  |  |
| 0.180000000000003 | 0.968 |  |  |
| 0.183000000000003 | 0.967 |  |  |
| 0.186000000000003 | 0.966 |  |  |
| 0.189000000000003 | 0.965 |  |  |
| 0.192000000000003 | 0.964 |  |  |
| 0.195000000000003 | 0.963 |  |  |
| 0.198000000000003 | 0.962 |  |  |
| 0.201000000000003 | 0.96 |  |  |
| 0.204000000000003 | 0.959 |  |  |
| 0.207000000000003 | 0.958 |  |  |
| 0.210000000000003 | 0.957 |  |  |
| 0.213000000000003 | 0.956 |  |  |
| 0.216000000000003 | 0.954 |  |  |
| 0.219000000000003 | 0.953 |  |  |
| 0.222000000000003 | 0.952 |  |  |
| 0.225000000000003 | 0.951 |  |  |
| 0.228000000000003 | 0.949 |  |  |
| 0.231000000000003 | 0.948 |  |  |
| 0.234000000000003 | 0.947 |  |  |
| 0.237000000000003 | 0.945 |  |  |
| 0.240000000000003 | 0.944 |  |  |
| 0.243000000000003 | 0.943 |  |  |
| 0.246000000000003 | 0.941 |  |  |
| 0.249000000000003 | 0.94 |  |  |
| 0.252000000000003 | 0.938 |  |  |
| 0.255000000000003 | 0.937 |  |  |
| 0.258000000000003 | 0.936 |  |  |
| 0.261000000000003 | 0.934 |  |  |
| 0.264000000000003 | 0.933 |  |  |
| 0.267000000000003 | 0.931 |  |  |
| 0.270000000000003 | 0.93 |  |  |
| 0.273000000000003 | 0.928 |  |  |
| 0.276000000000003 | 0.927 |  |  |
| 0.279000000000003 | 0.925 |  |  |
| 0.282000000000003 | 0.924 |  |  |
| 0.285000000000003 | 0.922 |  |  |
| 0.288000000000003 | 0.92 |  |  |
| 0.291000000000003 | 0.919 |  |  |
| 0.294000000000003 | 0.917 |  |  |
| 0.297000000000003 | 0.916 |  |  |
| 0.300000000000003 | 0.914 |  |  |
| 0.303000000000003 | 0.912 |  |  |
| 0.306000000000003 | 0.911 |  |  |
| 0.309000000000003 | 0.909 |  |  |
| 0.312000000000003 | 0.907 |  |  |
| 0.315000000000003 | 0.906 |  |  |
| 0.318000000000003 | 0.904 |  |  |
| 0.321000000000003 | 0.902 |  |  |
| 0.324000000000003 | 0.9 |  |  |
| 0.327000000000003 | 0.899 |  |  |
| 0.330000000000003 | 0.897 |  |  |
| 0.333000000000003 | 0.895 |  |  |
| 0.336000000000003 | 0.893 |  |  |
| 0.339000000000003 | 0.891 |  |  |
| 0.342000000000003 | 0.89 |  |  |
| 0.345000000000003 | 0.888 |  |  |
| 0.348000000000003 | 0.886 |  |  |
| 0.351000000000003 | 0.884 |  |  |
| 0.354000000000003 | 0.882 |  |  |
| 0.357000000000003 | 0.88 |  |  |
| 0.360000000000003 | 0.878 |  |  |
| 0.363000000000003 | 0.877 |  |  |
| 0.366000000000003 | 0.875 |  |  |
| 0.369000000000003 | 0.873 |  |  |
| 0.372000000000003 | 0.871 |  |  |
| 0.375000000000003 | 0.869 |  |  |
| 0.378000000000003 | 0.867 |  |  |
| 0.381000000000003 | 0.865 |  |  |
| 0.384000000000003 | 0.863 |  |  |
| 0.387000000000003 | 0.861 |  |  |
| 0.390000000000003 | 0.859 |  |  |
| 0.393000000000003 | 0.857 |  |  |
| 0.396000000000003 | 0.855 |  |  |
| 0.399000000000003 | 0.853 |  |  |
| 0.402000000000003 | 0.851 |  |  |
| 0.405000000000003 | 0.849 |  |  |
| 0.408000000000003 | 0.847 |  |  |
| 0.411000000000003 | 0.845 |  |  |
| 0.414000000000003 | 0.842 |  |  |
| 0.417000000000003 | 0.84 |  |  |
| 0.420000000000003 | 0.838 |  |  |
| 0.423000000000003 | 0.836 |  |  |
| 0.426000000000003 | 0.834 |  |  |
| 0.429000000000003 | 0.832 |  |  |
| 0.432000000000003 | 0.83 |  |  |
| 0.435000000000003 | 0.828 |  |  |
| 0.438000000000003 | 0.825 |  |  |
| 0.441000000000003 | 0.823 |  |  |
| 0.444000000000003 | 0.821 |  |  |
| 0.447000000000003 | 0.819 |  |  |
| 0.450000000000003 | 0.817 |  |  |
| 0.453000000000003 | 0.814 |  |  |
| 0.456000000000003 | 0.812 |  |  |
| 0.459000000000003 | 0.81 |  |  |
| 0.462000000000003 | 0.808 |  |  |
| 0.465000000000003 | 0.806 |  |  |
| 0.468000000000003 | 0.803 |  |  |
| 0.471000000000003 | 0.801 |  |  |
| 0.474000000000003 | 0.799 |  |  |
| 0.477000000000003 | 0.796 |  |  |
| 0.480000000000003 | 0.794 |  |  |
| 0.483000000000003 | 0.792 |  |  |
| 0.486000000000003 | 0.79 |  |  |
| 0.489000000000003 | 0.787 |  |  |
| 0.492000000000003 | 0.785 |  |  |
| 0.495000000000003 | 0.783 |  |  |
| 0.498000000000003 | 0.78 |  |  |
| 0.501000000000003 | 0.778 |  |  |
| 0.504000000000003 | 0.776 |  |  |
| 0.507000000000003 | 0.773 |  |  |
| 0.510000000000003 | 0.771 |  |  |
| 0.513000000000003 | 0.769 |  |  |
| 0.516000000000003 | 0.766 |  |  |
| 0.519000000000003 | 0.764 |  |  |
| 0.522000000000003 | 0.761 |  |  |
| 0.525000000000003 | 0.759 |  |  |
| 0.528000000000003 | 0.757 |  |  |
| 0.531000000000003 | 0.754 |  |  |
| 0.534000000000003 | 0.752 |  |  |
| 0.537000000000003 | 0.749 |  |  |
| 0.540000000000003 | 0.747 |  |  |
| 0.543000000000003 | 0.745 |  |  |
| 0.546000000000003 | 0.742 |  |  |
| 0.549000000000003 | 0.74 |  |  |
| 0.552000000000003 | 0.737 |  |  |
| 0.555000000000003 | 0.735 |  |  |
| 0.558000000000003 | 0.732 |  |  |
| 0.561000000000003 | 0.73 |  |  |
| 0.564000000000003 | 0.728 |  |  |
| 0.567000000000003 | 0.725 |  |  |
| 0.570000000000003 | 0.723 |  |  |
| 0.573000000000003 | 0.72 |  |  |
| 0.576000000000003 | 0.718 |  |  |
| 0.579000000000003 | 0.715 |  |  |
| 0.582000000000003 | 0.713 |  |  |
| 0.585000000000003 | 0.71 |  |  |
| 0.588000000000003 | 0.708 |  |  |
| 0.591000000000003 | 0.705 |  |  |
| 0.594000000000003 | 0.703 |  |  |
| 0.597000000000003 | 0.7 |  |  |
| 0.600000000000003 | 0.698 |  |  |
| 0.603000000000003 | 0.695 |  |  |
| 0.606000000000003 | 0.693 |  |  |
| 0.609000000000003 | 0.69 |  |  |
| 0.612000000000003 | 0.688 |  |  |
| 0.615000000000003 | 0.685 |  |  |
| 0.618000000000003 | 0.683 |  |  |
| 0.621000000000003 | 0.68 |  |  |
| 0.624000000000003 | 0.677 |  |  |
| 0.627000000000003 | 0.675 |  |  |
| 0.630000000000003 | 0.672 |  |  |
| 0.633000000000003 | 0.67 |  |  |
| 0.636000000000003 | 0.667 |  |  |
| 0.639000000000003 | 0.665 |  |  |
| 0.642000000000003 | 0.662 |  |  |
| 0.645000000000003 | 0.66 |  |  |
| 0.648000000000003 | 0.657 |  |  |
| 0.651000000000003 | 0.655 |  |  |
| 0.654000000000003 | 0.652 |  |  |
| 0.657000000000003 | 0.649 |  |  |
| 0.660000000000003 | 0.647 |  |  |
| 0.663000000000003 | 0.644 |  |  |
| 0.666000000000003 | 0.642 |  |  |
| 0.669000000000003 | 0.639 |  |  |
| 0.672000000000003 | 0.637 |  |  |
| 0.675000000000003 | 0.634 |  |  |
| 0.678000000000003 | 0.631 |  |  |
| 0.681000000000003 | 0.629 |  |  |
| 0.684000000000003 | 0.626 |  |  |
| 0.687000000000003 | 0.624 |  |  |
| 0.690000000000003 | 0.621 |  |  |
| 0.693000000000003 | 0.619 |  |  |
| 0.696000000000003 | 0.616 |  |  |
| 0.699000000000003 | 0.613 |  |  |
| 0.702000000000003 | 0.611 |  |  |
| 0.705000000000003 | 0.608 |  |  |
| 0.708000000000003 | 0.606 |  |  |
| 0.711000000000003 | 0.603 |  |  |
| 0.714000000000003 | 0.601 |  |  |
| 0.717000000000003 | 0.598 |  |  |
| 0.720000000000003 | 0.595 |  |  |
| 0.723000000000003 | 0.593 |  |  |
| 0.726000000000003 | 0.59 |  |  |
| 0.729000000000003 | 0.588 |  |  |
| 0.732000000000003 | 0.585 |  |  |
| 0.735000000000003 | 0.583 |  |  |
| 0.738000000000003 | 0.58 |  |  |
| 0.741000000000003 | 0.577 |  |  |
| 0.744000000000003 | 0.575 |  |  |
| 0.747000000000003 | 0.572 |  |  |
| 0.750000000000003 | 0.57 |  |  |
| 0.753000000000003 | 0.567 |  |  |
| 0.756000000000003 | 0.565 |  |  |
| 0.759000000000003 | 0.562 |  |  |
| 0.762000000000003 | 0.56 |  |  |
| 0.765000000000003 | 0.557 |  |  |
| 0.768000000000003 | 0.554 |  |  |
| 0.771000000000003 | 0.552 |  |  |
| 0.774000000000003 | 0.549 |  |  |
| 0.777000000000003 | 0.547 |  |  |
| 0.780000000000003 | 0.544 |  |  |
| 0.783000000000003 | 0.542 |  |  |
| 0.786000000000003 | 0.539 |  |  |
| 0.789000000000003 | 0.537 |  |  |
| 0.792000000000003 | 0.534 |  |  |
| 0.795000000000003 | 0.532 |  |  |
| 0.798000000000003 | 0.529 |  |  |
| 0.801000000000003 | 0.526 |  |  |
| 0.804000000000003 | 0.524 |  |  |
| 0.807000000000003 | 0.521 |  |  |
| 0.810000000000003 | 0.519 |  |  |
| 0.813000000000003 | 0.516 |  |  |
| 0.816000000000003 | 0.514 |  |  |
| 0.819000000000003 | 0.511 |  |  |
| 0.822000000000003 | 0.509 |  |  |
| 0.825000000000003 | 0.506 |  |  |
| 0.828000000000003 | 0.504 |  |  |
| 0.831000000000003 | 0.501 |  |  |
| 0.834000000000003 | 0.499 |  |  |
| 0.837000000000003 | 0.496 |  |  |
| 0.840000000000003 | 0.494 |  |  |
| 0.843000000000003 | 0.491 |  |  |
| 0.846000000000003 | 0.489 |  |  |
| 0.849000000000003 | 0.486 |  |  |
| 0.852000000000003 | 0.484 |  |  |
| 0.855000000000003 | 0.481 |  |  |
| 0.858000000000003 | 0.479 |  |  |
| 0.861000000000003 | 0.476 |  |  |
| 0.864000000000003 | 0.474 |  |  |
| 0.867000000000003 | 0.472 |  |  |
| 0.870000000000003 | 0.469 |  |  |
| 0.873000000000003 | 0.467 |  |  |
| 0.876000000000003 | 0.464 |  |  |
| 0.879000000000003 | 0.462 |  |  |
| 0.882000000000003 | 0.459 |  |  |
| 0.885000000000003 | 0.457 |  |  |
| 0.888000000000003 | 0.455 |  |  |
| 0.891000000000003 | 0.452 |  |  |
| 0.894000000000003 | 0.45 |  |  |
| 0.897000000000003 | 0.447 |  |  |
| 0.900000000000003 | 0.445 |  |  |
| 0.903000000000003 | 0.442 |  |  |
| 0.906000000000003 | 0.44 |  |  |
| 0.909000000000003 | 0.438 |  |  |
| 0.912000000000003 | 0.435 |  |  |
| 0.915000000000003 | 0.433 |  |  |
| 0.918000000000003 | 0.431 |  |  |
| 0.921000000000003 | 0.428 |  |  |
| 0.924000000000003 | 0.426 |  |  |
| 0.927000000000003 | 0.423 |  |  |
| 0.930000000000003 | 0.421 |  |  |
| 0.933000000000003 | 0.419 |  |  |
| 0.936000000000003 | 0.416 |  |  |
| 0.939000000000003 | 0.414 |  |  |
| 0.942000000000003 | 0.412 |  |  |
| 0.945000000000003 | 0.409 |  |  |
| 0.948000000000003 | 0.407 |  |  |
| 0.951000000000003 | 0.405 |  |  |
| 0.954000000000003 | 0.402 |  |  |
| 0.957000000000003 | 0.4 |  |  |
| 0.960000000000003 | 0.398 |  |  |
| 0.963000000000003 | 0.396 |  |  |
| 0.966000000000003 | 0.393 |  |  |
| 0.969000000000003 | 0.391 |  |  |
| 0.972000000000003 | 0.389 |  |  |
| 0.975000000000003 | 0.386 |  |  |
| 0.978000000000003 | 0.384 |  |  |
| 0.981000000000003 | 0.382 |  |  |
| 0.984000000000003 | 0.38 |  |  |
| 0.987000000000003 | 0.378 |  |  |
| 0.990000000000003 | 0.375 |  |  |
| 0.993000000000003 | 0.373 |  |  |
| 0.996000000000003 | 0.371 |  |  |
| 0.999000000000003 | 0.369 |  |  |
| 1.002000000000003 | 0.366 |  |  |
| 1.005000000000003 | 0.364 |  |  |
| 1.008000000000003 | 0.362 |  |  |
| 1.011000000000003 | 0.36 |  |  |
| 1.014000000000003 | 0.358 |  |  |
| 1.017000000000003 | 0.355 |  |  |
| 1.020000000000003 | 0.353 |  |  |
| 1.023000000000003 | 0.351 |  |  |
| 1.026000000000002 | 0.349 |  |  |
| 1.029000000000002 | 0.347 |  |  |
| 1.032000000000002 | 0.345 |  |  |
| 1.035000000000002 | 0.343 |  |  |
| 1.038000000000002 | 0.34 |  |  |
| 1.041000000000002 | 0.338 |  |  |
| 1.044000000000002 | 0.336 |  |  |
| 1.047000000000002 | 0.334 |  |  |
| 1.050000000000002 | 0.332 |  |  |
| 1.053000000000001 | 0.33 |  |  |
| 1.056000000000001 | 0.328 |  |  |
| 1.059000000000001 | 0.326 |  |  |
| 1.062000000000001 | 0.324 |  |  |
| 1.065000000000001 | 0.322 |  |  |
| 1.068000000000001 | 0.32 |  |  |
| 1.071000000000001 | 0.318 |  |  |
| 1.074000000000001 | 0.316 |  |  |
| 1.077000000000001 | 0.314 |  |  |
| 1.08 | 0.311 |  |  |
| 1.083 | 0.309 |  |  |
| 1.086 | 0.307 |  |  |
| 1.089 | 0.305 |  |  |
| 1.092 | 0.303 |  |  |
| 1.095 | 0.301 |  |  |
| 1.098 | 0.3 |  |  |
| 1.101 | 0.298 |  |  |
| 1.104 | 0.296 |  |  |
| 1.107 | 0.294 |  |  |
| 1.109999999999999 | 0.292 |  |  |
| 1.112999999999999 | 0.29 |  |  |
| 1.115999999999999 | 0.288 |  |  |
| 1.118999999999999 | 0.286 |  |  |
| 1.121999999999999 | 0.284 |  |  |
| 1.124999999999999 | 0.282 |  |  |
| 1.127999999999999 | 0.28 |  |  |
| 1.130999999999999 | 0.278 |  |  |
| 1.133999999999999 | 0.276 |  |  |
| 1.136999999999998 | 0.275 |  |  |
| 1.139999999999998 | 0.273 |  |  |
| 1.142999999999998 | 0.271 |  |  |
| 1.145999999999998 | 0.269 |  |  |
| 1.148999999999998 | 0.267 |  |  |
| 1.151999999999998 | 0.265 |  |  |
| 1.154999999999998 | 0.263 |  |  |
| 1.157999999999998 | 0.262 |  |  |
| 1.160999999999998 | 0.26 |  |  |
| 1.163999999999997 | 0.258 |  |  |
| 1.166999999999997 | 0.256 |  |  |
| 1.169999999999997 | 0.254 |  |  |
| 1.172999999999997 | 0.253 |  |  |
| 1.175999999999997 | 0.251 |  |  |
| 1.178999999999997 | 0.249 |  |  |
| 1.181999999999997 | 0.247 |  |  |
| 1.184999999999997 | 0.246 |  |  |
| 1.187999999999997 | 0.244 |  |  |
| 1.190999999999996 | 0.242 |  |  |
| 1.193999999999996 | 0.24 |  |  |
| 1.196999999999996 | 0.239 |  |  |
| 1.199999999999996 | 0.237 |  |  |
| 1.202999999999996 | 0.235 |  |  |
| 1.205999999999996 | 0.234 |  |  |
| 1.208999999999996 | 0.232 |  |  |
| 1.211999999999996 | 0.23 |  |  |
| 1.214999999999996 | 0.228 |  |  |
| 1.217999999999996 | 0.227 |  |  |
| 1.220999999999995 | 0.225 |  |  |
| 1.223999999999995 | 0.224 |  |  |
| 1.226999999999995 | 0.222 |  |  |
| 1.229999999999995 | 0.22 |  |  |
| 1.232999999999995 | 0.219 |  |  |
| 1.235999999999995 | 0.217 |  |  |
| 1.238999999999995 | 0.215 |  |  |
| 1.241999999999995 | 0.214 |  |  |
| 1.244999999999995 | 0.212 |  |  |
| 1.247999999999994 | 0.211 |  |  |
| 1.250999999999994 | 0.209 |  |  |
| 1.253999999999994 | 0.208 |  |  |
| 1.256999999999994 | 0.206 |  |  |
| 1.259999999999994 | 0.204 |  |  |
| 1.262999999999994 | 0.203 |  |  |
| 1.265999999999994 | 0.201 |  |  |
| 1.268999999999994 | 0.2 |  |  |
| 1.271999999999994 | 0.198 |  |  |
| 1.274999999999993 | 0.197 |  |  |
| 1.277999999999993 | 0.195 |  |  |
| 1.280999999999993 | 0.194 |  |  |
| 1.283999999999993 | 0.192 |  |  |
| 1.286999999999993 | 0.191 |  |  |
| 1.289999999999993 | 0.189 |  |  |
| 1.292999999999993 | 0.188 |  |  |
| 1.295999999999993 | 0.186 |  |  |
| 1.298999999999993 | 0.185 |  |  |
| 1.301999999999992 | 0.184 |  |  |
| 1.304999999999992 | 0.182 |  |  |
| 1.307999999999992 | 0.181 |  |  |
| 1.310999999999992 | 0.179 |  |  |
| 1.313999999999992 | 0.178 |  |  |
| 1.316999999999992 | 0.176 |  |  |
| 1.319999999999992 | 0.175 |  |  |
| 1.322999999999992 | 0.174 |  |  |
| 1.325999999999992 | 0.172 |  |  |
| 1.328999999999991 | 0.171 |  |  |
| 1.331999999999991 | 0.17 |  |  |
| 1.334999999999991 | 0.168 |  |  |
| 1.337999999999991 | 0.167 |  |  |
| 1.340999999999991 | 0.166 |  |  |
| 1.343999999999991 | 0.164 |  |  |
| 1.346999999999991 | 0.163 |  |  |
| 1.349999999999991 | 0.162 |  |  |
| 1.352999999999991 | 0.16 |  |  |
| 1.35599999999999 | 0.159 |  |  |
| 1.35899999999999 | 0.158 |  |  |
| 1.36199999999999 | 0.156 |  |  |
| 1.36499999999999 | 0.155 |  |  |
| 1.36799999999999 | 0.154 |  |  |
| 1.37099999999999 | 0.153 |  |  |
| 1.37399999999999 | 0.151 |  |  |
| 1.37699999999999 | 0.15 |  |  |
| 1.37999999999999 | 0.149 |  |  |
| 1.38299999999999 | 0.148 |  |  |
| 1.385999999999989 | 0.146 |  |  |
| 1.388999999999989 | 0.145 |  |  |
| 1.391999999999989 | 0.144 |  |  |
| 1.394999999999989 | 0.143 |  |  |
| 1.397999999999989 | 0.142 |  |  |
| 1.400999999999989 | 0.14 |  |  |
| 1.403999999999989 | 0.139 |  |  |
| 1.406999999999989 | 0.138 |  |  |
| 1.409999999999989 | 0.137 |  |  |
| 1.412999999999988 | 0.136 |  |  |
| 1.415999999999988 | 0.135 |  |  |
| 1.418999999999988 | 0.134 |  |  |
| 1.421999999999988 | 0.132 |  |  |
| 1.424999999999988 | 0.131 |  |  |
| 1.427999999999988 | 0.13 |  |  |
| 1.430999999999988 | 0.129 |  |  |
| 1.433999999999988 | 0.128 |  |  |
| 1.436999999999988 | 0.127 |  |  |
| 1.439999999999987 | 0.126 |  |  |
| 1.442999999999987 | 0.125 |  |  |
| 1.445999999999987 | 0.124 |  |  |
| 1.448999999999987 | 0.123 |  |  |
| 1.451999999999987 | 0.121 |  |  |
| 1.454999999999987 | 0.12 |  |  |
| 1.457999999999987 | 0.119 |  |  |
| 1.460999999999987 | 0.118 |  |  |
| 1.463999999999987 | 0.117 |  |  |
| 1.466999999999987 | 0.116 |  |  |
| 1.469999999999986 | 0.115 |  |  |
| 1.472999999999986 | 0.114 |  |  |
| 1.475999999999986 | 0.113 |  |  |
| 1.478999999999986 | 0.112 |  |  |
| 1.481999999999986 | 0.111 |  |  |
| 1.484999999999986 | 0.11 |  |  |
| 1.487999999999986 | 0.109 |  |  |
| 1.490999999999986 | 0.108 |  |  |
| 1.493999999999986 | 0.107 |  |  |
| 1.496999999999985 | 0.106 |  |  |
| 1.499999999999985 | 0.105 |  |  |
| 1.502999999999985 | 0.104 |  |  |
| 1.505999999999985 | 0.104 |  |  |
| 1.508999999999985 | 0.103 |  |  |
| 1.511999999999985 | 0.102 |  |  |
| 1.514999999999985 | 0.101 |  |  |
| 1.517999999999985 | 0.1 |  |  |
| 1.520999999999985 | 0.099 |  |  |
| 1.523999999999984 | 0.098 |  |  |
| 1.526999999999984 | 0.097 |  |  |
| 1.529999999999984 | 0.096 |  |  |
| 1.532999999999984 | 0.095 |  |  |
| 1.535999999999984 | 0.094 |  |  |
| 1.538999999999984 | 0.094 |  |  |
| 1.541999999999984 | 0.093 |  |  |
| 1.544999999999984 | 0.092 |  |  |
| 1.547999999999984 | 0.091 |  |  |
| 1.550999999999983 | 0.09 |  |  |
| 1.553999999999983 | 0.089 |  |  |
| 1.556999999999983 | 0.089 |  |  |
| 1.559999999999983 | 0.088 |  |  |
| 1.562999999999983 | 0.087 |  |  |
| 1.565999999999983 | 0.086 |  |  |
| 1.568999999999983 | 0.085 |  |  |
| 1.571999999999983 | 0.084 |  |  |
| 1.574999999999983 | 0.084 |  |  |
| 1.577999999999983 | 0.083 |  |  |
| 1.580999999999982 | 0.082 |  |  |
| 1.583999999999982 | 0.081 |  |  |
| 1.586999999999982 | 0.081 |  |  |
| 1.589999999999982 | 0.08 |  |  |
| 1.592999999999982 | 0.079 |  |  |
| 1.595999999999982 | 0.078 |  |  |
| 1.598999999999982 | 0.078 |  |  |
| 1.601999999999982 | 0.077 |  |  |
| 1.604999999999981 | 0.076 |  |  |
| 1.607999999999981 | 0.075 |  |  |
| 1.610999999999981 | 0.075 |  |  |
| 1.613999999999981 | 0.074 |  |  |
| 1.616999999999981 | 0.073 |  |  |
| 1.619999999999981 | 0.072 |  |  |
| 1.622999999999981 | 0.072 |  |  |
| 1.625999999999981 | 0.071 |  |  |
| 1.628999999999981 | 0.07 |  |  |
| 1.63199999999998 | 0.07 |  |  |
| 1.63499999999998 | 0.069 |  |  |
| 1.63799999999998 | 0.068 |  |  |
| 1.64099999999998 | 0.068 |  |  |
| 1.64399999999998 | 0.067 |  |  |
| 1.64699999999998 | 0.066 |  |  |
| 1.64999999999998 | 0.066 |  |  |
| 1.65299999999998 | 0.065 |  |  |
| 1.65599999999998 | 0.064 |  |  |
| 1.65899999999998 | 0.064 |  |  |
| 1.661999999999979 | 0.063 |  |  |
| 1.664999999999979 | 0.063 |  |  |
| 1.667999999999979 | 0.062 |  |  |
| 1.670999999999979 | 0.061 |  |  |
| 1.673999999999979 | 0.061 |  |  |
| 1.676999999999979 | 0.06 |  |  |
| 1.679999999999979 | 0.059 |  |  |
| 1.682999999999979 | 0.059 |  |  |
| 1.685999999999979 | 0.058 |  |  |
| 1.688999999999978 | 0.058 |  |  |
| 1.691999999999978 | 0.057 |  |  |
| 1.694999999999978 | 0.057 |  |  |
| 1.697999999999978 | 0.056 |  |  |
| 1.700999999999978 | 0.055 |  |  |
| 1.703999999999978 | 0.055 |  |  |
| 1.706999999999978 | 0.054 |  |  |
| 1.709999999999978 | 0.054 |  |  |
| 1.712999999999978 | 0.053 |  |  |
| 1.715999999999977 | 0.053 |  |  |
| 1.718999999999977 | 0.052 |  |  |
| 1.721999999999977 | 0.052 |  |  |
| 1.724999999999977 | 0.051 |  |  |
| 1.727999999999977 | 0.05 |  |  |
| 1.730999999999977 | 0.05 |  |  |
| 1.733999999999977 | 0.049 |  |  |
| 1.736999999999977 | 0.049 |  |  |
| 1.739999999999977 | 0.048 |  |  |
| 1.742999999999976 | 0.048 |  |  |
| 1.745999999999976 | 0.047 |  |  |
| 1.748999999999976 | 0.047 |  |  |
| 1.751999999999976 | 0.046 |  |  |
| 1.754999999999976 | 0.046 |  |  |
| 1.757999999999976 | 0.045 |  |  |
| 1.760999999999976 | 0.045 |  |  |
| 1.763999999999976 | 0.045 |  |  |
| 1.766999999999976 | 0.044 |  |  |
| 1.769999999999976 | 0.044 |  |  |
| 1.772999999999975 | 0.043 |  |  |
| 1.775999999999975 | 0.043 |  |  |
| 1.778999999999975 | 0.042 |  |  |
| 1.781999999999975 | 0.042 |  |  |
| 1.784999999999975 | 0.041 |  |  |
| 1.787999999999975 | 0.041 |  |  |
| 1.790999999999975 | 0.04 |  |  |
| 1.793999999999975 | 0.04 |  |  |
| 1.796999999999975 | 0.04 |  |  |
| 1.799999999999974 | 0.039 |  |  |
| 1.802999999999974 | 0.039 |  |  |
| 1.805999999999974 | 0.038 |  |  |
| 1.808999999999974 | 0.038 |  |  |
| 1.811999999999974 | 0.038 |  |  |
| 1.814999999999974 | 0.037 |  |  |
| 1.817999999999974 | 0.037 |  |  |
| 1.820999999999974 | 0.036 |  |  |
| 1.823999999999974 | 0.036 |  |  |
| 1.826999999999973 | 0.036 |  |  |
| 1.829999999999973 | 0.035 |  |  |
| 1.832999999999973 | 0.035 |  |  |
| 1.835999999999973 | 0.034 |  |  |
| 1.838999999999973 | 0.034 |  |  |
| 1.841999999999973 | 0.034 |  |  |
| 1.844999999999973 | 0.033 |  |  |
| 1.847999999999973 | 0.033 |  |  |
| 1.850999999999973 | 0.033 |  |  |
| 1.853999999999973 | 0.032 |  |  |
| 1.856999999999972 | 0.032 |  |  |
| 1.859999999999972 | 0.031 |  |  |
| 1.862999999999972 | 0.031 |  |  |
| 1.865999999999972 | 0.031 |  |  |
| 1.868999999999972 | 0.03 |  |  |
| 1.871999999999972 | 0.03 |  |  |
| 1.874999999999972 | 0.03 |  |  |
| 1.877999999999972 | 0.029 |  |  |
| 1.880999999999972 | 0.029 |  |  |
| 1.883999999999971 | 0.029 |  |  |
| 1.886999999999971 | 0.028 |  |  |
| 1.889999999999971 | 0.028 |  |  |
| 1.892999999999971 | 0.028 |  |  |
| 1.895999999999971 | 0.027 |  |  |
| 1.898999999999971 | 0.027 |  |  |
| 1.901999999999971 | 0.027 |  |  |
| 1.904999999999971 | 0.027 |  |  |
| 1.907999999999971 | 0.026 |  |  |
| 1.91099999999997 | 0.026 |  |  |
| 1.91399999999997 | 0.026 |  |  |
| 1.91699999999997 | 0.025 |  |  |
| 1.91999999999997 | 0.025 |  |  |
| 1.92299999999997 | 0.025 |  |  |
| 1.92599999999997 | 0.024 |  |  |
| 1.92899999999997 | 0.024 |  |  |
| 1.93199999999997 | 0.024 |  |  |
| 1.93499999999997 | 0.024 |  |  |
| 1.937999999999969 | 0.023 |  |  |
| 1.940999999999969 | 0.023 |  |  |
| 1.943999999999969 | 0.023 |  |  |
| 1.946999999999969 | 0.023 |  |  |
| 1.949999999999969 | 0.022 |  |  |
| 1.952999999999969 | 0.022 |  |  |
| 1.955999999999969 | 0.022 |  |  |
| 1.958999999999969 | 0.022 |  |  |
| 1.961999999999969 | 0.021 |  |  |
| 1.964999999999969 | 0.021 |  |  |
| 1.967999999999968 | 0.021 |  |  |
| 1.970999999999968 | 0.021 |  |  |
| 1.973999999999968 | 0.02 |  |  |
| 1.976999999999968 | 0.02 |  |  |
| 1.979999999999968 | 0.02 |  |  |
| 1.982999999999968 | 0.02 |  |  |
| 1.985999999999968 | 0.019 |  |  |
| 1.988999999999968 | 0.019 |  |  |
| 1.991999999999968 | 0.019 |  |  |
| 1.994999999999967 | 0.019 |  |  |
| 1.997999999999967 | 0.018 |  |  |
| 2.000999999999967 | 0.018 |  |  |
| 2.003999999999968 | 0.018 |  |  |
| 2.006999999999968 | 0.018 |  |  |
| 2.009999999999968 | 0.018 |  |  |
| 2.012999999999968 | 0.017 |  |  |
| 2.015999999999968 | 0.017 |  |  |
| 2.018999999999968 | 0.017 |  |  |
| 2.021999999999968 | 0.017 |  |  |
| 2.024999999999968 | 0.017 |  |  |
| 2.027999999999968 | 0.016 |  |  |
| 2.030999999999969 | 0.016 |  |  |
| 2.033999999999969 | 0.016 |  |  |
| 2.036999999999969 | 0.016 |  |  |
| 2.039999999999969 | 0.016 |  |  |
| 2.042999999999969 | 0.015 |  |  |
| 2.045999999999969 | 0.015 |  |  |
| 2.048999999999969 | 0.015 |  |  |
| 2.051999999999969 | 0.015 |  |  |
| 2.05499999999997 | 0.015 |  |  |
| 2.05799999999997 | 0.014 |  |  |
| 2.06099999999997 | 0.014 |  |  |
| 2.06399999999997 | 0.014 |  |  |
| 2.06699999999997 | 0.014 |  |  |
| 2.06999999999997 | 0.014 |  |  |
| 2.07299999999997 | 0.014 |  |  |
| 2.07599999999997 | 0.013 |  |  |
| 2.07899999999997 | 0.013 |  |  |
| 2.081999999999971 | 0.013 |  |  |
| 2.084999999999971 | 0.013 |  |  |
| 2.087999999999971 | 0.013 |  |  |
| 2.090999999999971 | 0.013 |  |  |
| 2.093999999999971 | 0.012 |  |  |
| 2.096999999999971 | 0.012 |  |  |
| 2.099999999999971 | 0.012 |  |  |
| 2.102999999999971 | 0.012 |  |  |
| 2.105999999999971 | 0.012 |  |  |
| 2.108999999999972 | 0.012 |  |  |
| 2.111999999999972 | 0.012 |  |  |
| 2.114999999999972 | 0.011 |  |  |
| 2.117999999999972 | 0.011 |  |  |
| 2.120999999999972 | 0.011 |  |  |
| 2.123999999999972 | 0.011 |  |  |
| 2.126999999999972 | 0.011 |  |  |
| 2.129999999999972 | 0.011 |  |  |
| 2.132999999999972 | 0.011 |  |  |
| 2.135999999999973 | 0.01 |  |  |
| 2.138999999999973 | 0.01 |  |  |
| 2.141999999999973 | 0.01 |  |  |
| 2.144999999999973 | 0.01 |  |  |
| 2.147999999999973 | 0.01 |  |  |
| 2.150999999999973 | 0.01 |  |  |
| 2.153999999999973 | 0.01 |  |  |
| 2.156999999999973 | 0.01 |  |  |
| 2.159999999999973 | 0.009 |  |  |
| 2.162999999999974 | 0.009 |  |  |
| 2.165999999999974 | 0.009 |  |  |
| 2.168999999999974 | 0.009 |  |  |
| 2.171999999999974 | 0.009 |  |  |
| 2.174999999999974 | 0.009 |  |  |
| 2.177999999999974 | 0.009 |  |  |
| 2.180999999999974 | 0.009 |  |  |
| 2.183999999999974 | 0.008 |  |  |
| 2.186999999999974 | 0.008 |  |  |
| 2.189999999999975 | 0.008 |  |  |
| 2.192999999999975 | 0.008 |  |  |
| 2.195999999999975 | 0.008 |  |  |
| 2.198999999999975 | 0.008 |  |  |
| 2.201999999999975 | 0.008 |  |  |
| 2.204999999999975 | 0.008 |  |  |
| 2.207999999999975 | 0.008 |  |  |
| 2.210999999999975 | 0.008 |  |  |
| 2.213999999999976 | 0.007 |  |  |
| 2.216999999999976 | 0.007 |  |  |
| 2.219999999999976 | 0.007 |  |  |
| 2.222999999999976 | 0.007 |  |  |
| 2.225999999999976 | 0.007 |  |  |
| 2.228999999999976 | 0.007 |  |  |
| 2.231999999999976 | 0.007 |  |  |
| 2.234999999999976 | 0.007 |  |  |
| 2.237999999999976 | 0.007 |  |  |
| 2.240999999999976 | 0.007 |  |  |
| 2.243999999999976 | 0.007 |  |  |
| 2.246999999999977 | 0.006 |  |  |
| 2.249999999999977 | 0.006 |  |  |
| 2.252999999999977 | 0.006 |  |  |
| 2.255999999999977 | 0.006 |  |  |
| 2.258999999999977 | 0.006 |  |  |
| 2.261999999999977 | 0.006 |  |  |
| 2.264999999999977 | 0.006 |  |  |
| 2.267999999999977 | 0.006 |  |  |
| 2.270999999999978 | 0.006 |  |  |
| 2.273999999999978 | 0.006 |  |  |
| 2.276999999999978 | 0.006 |  |  |
| 2.279999999999978 | 0.006 |  |  |
| 2.282999999999978 | 0.005 |  |  |
| 2.285999999999978 | 0.005 |  |  |
| 2.288999999999978 | 0.005 |  |  |
| 2.291999999999978 | 0.005 |  |  |
| 2.294999999999979 | 0.005 |  |  |
| 2.297999999999979 | 0.005 |  |  |
| 2.300999999999979 | 0.005 |  |  |
| 2.303999999999979 | 0.005 |  |  |
| 2.306999999999979 | 0.005 |  |  |
| 2.309999999999979 | 0.005 |  |  |
| 2.312999999999979 | 0.005 |  |  |
| 2.315999999999979 | 0.005 |  |  |
| 2.318999999999979 | 0.005 |  |  |
| 2.32199999999998 | 0.005 |  |  |
| 2.32499999999998 | 0.004 |  |  |
| 2.32799999999998 | 0.004 |  |  |
| 2.33099999999998 | 0.004 |  |  |
| 2.33399999999998 | 0.004 |  |  |
| 2.33699999999998 | 0.004 |  |  |
| 2.33999999999998 | 0.004 |  |  |
| 2.34299999999998 | 0.004 |  |  |
| 2.34599999999998 | 0.004 |  |  |
| 2.348999999999981 | 0.004 |  |  |
| 2.351999999999981 | 0.004 |  |  |
| 2.354999999999981 | 0.004 |  |  |
| 2.357999999999981 | 0.004 |  |  |
| 2.360999999999981 | 0.004 |  |  |
| 2.363999999999981 | 0.004 |  |  |
| 2.366999999999981 | 0.004 |  |  |
| 2.369999999999981 | 0.004 |  |  |
| 2.372999999999982 | 0.004 |  |  |
| 2.375999999999982 | 0.004 |  |  |
| 2.378999999999982 | 0.003 |  |  |
| 2.381999999999982 | 0.003 |  |  |
| 2.384999999999982 | 0.003 |  |  |
| 2.387999999999982 | 0.003 |  |  |
| 2.390999999999982 | 0.003 |  |  |
| 2.393999999999982 | 0.003 |  |  |
| 2.396999999999982 | 0.003 |  |  |
| 2.399999999999983 | 0.003 |  |  |
| 2.402999999999983 | 0.003 |  |  |
| 2.405999999999983 | 0.003 |  |  |
| 2.408999999999983 | 0.003 |  |  |
| 2.411999999999983 | 0.003 |  |  |
| 2.414999999999983 | 0.003 |  |  |
| 2.417999999999983 | 0.003 |  |  |
| 2.420999999999983 | 0.003 |  |  |
| 2.423999999999983 | 0.003 |  |  |
| 2.426999999999984 | 0.003 |  |  |
| 2.429999999999984 | 0.003 |  |  |
| 2.432999999999984 | 0.003 |  |  |
| 2.435999999999984 | 0.003 |  |  |
| 2.438999999999984 | 0.003 |  |  |
| 2.441999999999984 | 0.003 |  |  |
| 2.444999999999984 | 0.003 |  |  |
| 2.447999999999984 | 0.002 |  |  |
| 2.450999999999984 | 0.002 |  |  |
| 2.453999999999985 | 0.002 |  |  |
| 2.456999999999985 | 0.002 |  |  |
| 2.459999999999985 | 0.002 |  |  |
| 2.462999999999985 | 0.002 |  |  |
| 2.465999999999985 | 0.002 |  |  |
| 2.468999999999985 | 0.002 |  |  |
| 2.471999999999985 | 0.002 |  |  |
| 2.474999999999985 | 0.002 |  |  |
| 2.477999999999986 | 0.002 |  |  |
| 2.480999999999986 | 0.002 |  |  |
| 2.483999999999986 | 0.002 |  |  |
| 2.486999999999986 | 0.002 |  |  |
| 2.489999999999986 | 0.002 |  |  |
| 2.492999999999986 | 0.002 |  |  |
| 2.495999999999986 | 0.002 |  |  |
| 2.498999999999986 | 0.002 |  |  |
| 2.501999999999986 | 0.002 |  |  |
| 2.504999999999987 | 0.002 |  |  |
| 2.507999999999987 | 0.002 |  |  |
| 2.510999999999987 | 0.002 |  |  |
| 2.513999999999987 | 0.002 |  |  |
| 2.516999999999987 | 0.002 |  |  |
| 2.519999999999987 | 0.002 |  |  |
| 2.522999999999987 | 0.002 |  |  |
| 2.525999999999987 | 0.002 |  |  |
| 2.528999999999987 | 0.002 |  |  |
| 2.531999999999988 | 0.002 |  |  |
| 2.534999999999988 | 0.002 |  |  |
| 2.537999999999988 | 0.002 |  |  |
| 2.540999999999988 | 0.002 |  |  |
| 2.543999999999988 | 0.002 |  |  |
| 2.546999999999988 | 0.002 |  |  |
| 2.549999999999988 | 0.001 |  |  |
| 2.552999999999988 | 0.001 |  |  |
| 2.555999999999988 | 0.001 |  |  |
| 2.558999999999989 | 0.001 |  |  |
| 2.561999999999989 | 0.001 |  |  |
| 2.564999999999989 | 0.001 |  |  |
| 2.567999999999989 | 0.001 |  |  |
| 2.570999999999989 | 0.001 |  |  |
| 2.573999999999989 | 0.001 |  |  |
| 2.576999999999989 | 0.001 |  |  |
| 2.579999999999989 | 0.001 |  |  |
| 2.58299999999999 | 0.001 |  |  |
| 2.58599999999999 | 0.001 |  |  |
| 2.58899999999999 | 0.001 |  |  |
| 2.59199999999999 | 0.001 |  |  |
| 2.59499999999999 | 0.001 |  |  |
| 2.59799999999999 | 0.001 |  |  |
| 2.60099999999999 | 0.001 |  |  |
| 2.60399999999999 | 0.001 |  |  |
| 2.60699999999999 | 0.001 |  |  |
| 2.60999999999999 | 0.001 |  |  |
| 2.612999999999991 | 0.001 |  |  |
| 2.615999999999991 | 0.001 |  |  |
| 2.618999999999991 | 0.001 |  |  |
| 2.621999999999991 | 0.001 |  |  |
| 2.624999999999991 | 0.001 |  |  |
| 2.627999999999991 | 0.001 |  |  |
| 2.630999999999991 | 0.001 |  |  |
| 2.633999999999991 | 0.001 |  |  |
| 2.636999999999991 | 0.001 |  |  |
| 2.639999999999992 | 0.001 |  |  |
| 2.642999999999992 | 0.001 |  |  |
| 2.645999999999992 | 0.001 |  |  |
| 2.648999999999992 | 0.001 |  |  |
| 2.651999999999992 | 0.001 |  |  |
| 2.654999999999992 | 0.001 |  |  |
| 2.657999999999992 | 0.001 |  |  |
| 2.660999999999992 | 0.001 |  |  |
| 2.663999999999992 | 0.001 |  |  |
| 2.666999999999993 | 0.001 |  |  |
| 2.669999999999993 | 0.001 |  |  |
| 2.672999999999993 | 0.001 |  |  |
| 2.675999999999993 | 0.001 |  |  |
| 2.678999999999993 | 0.001 |  |  |
| 2.681999999999993 | 0.001 |  |  |
| 2.684999999999993 | 0.001 |  |  |
| 2.687999999999993 | 0.001 |  |  |
| 2.690999999999994 | 0.001 |  |  |
| 2.693999999999994 | 0.001 |  |  |
| 2.696999999999994 | 0.001 |  |  |
| 2.699999999999994 | 0.001 |  |  |
| 2.702999999999994 | 0.001 |  |  |
| 2.705999999999994 | 0.001 |  |  |
| 2.708999999999994 | 0.001 |  |  |
| 2.711999999999994 | 0.001 |  |  |
| 2.714999999999994 | 0.001 |  |  |
| 2.717999999999995 | 0.001 |  |  |
| 2.720999999999995 | 0.001 |  |  |
| 2.723999999999995 | 0.001 |  |  |
| 2.726999999999995 | 0.001 |  |  |
| 2.729999999999995 | 0.001 |  |  |
| 2.732999999999995 | 0.001 |  |  |
| 2.735999999999995 | 0.001 |  |  |
| 2.738999999999995 | 0.001 |  |  |
| 2.741999999999995 | 0.001 |  |  |
| 2.744999999999996 | 0.001 |  |  |
| 2.747999999999996 | 0.001 |  |  |
| 2.750999999999996 | 0.001 |  |  |
| 2.753999999999996 | 0.001 |  |  |
| 2.756999999999996 | 0 |  |  |
| 2.759999999999996 | 0 |  |  |
| 2.762999999999996 | 0 |  |  |
| 2.765999999999996 | 0 |  |  |
| 2.768999999999996 | 0 |  |  |
| 2.771999999999997 | 0 |  |  |
| 2.774999999999997 | 0 |  |  |
| 2.777999999999997 | 0 |  |  |
| 2.780999999999997 | 0 |  |  |
| 2.783999999999997 | 0 |  |  |
| 2.786999999999997 | 0 |  |  |
| 2.789999999999997 | 0 |  |  |
| 2.792999999999997 | 0 |  |  |
| 2.795999999999998 | 0 |  |  |
| 2.798999999999998 | 0 |  |  |
| 2.801999999999998 | 0 |  |  |
| 2.804999999999998 | 0 |  |  |
| 2.807999999999998 | 0 |  |  |
| 2.810999999999998 | 0 |  |  |
| 2.813999999999998 | 0 |  |  |
| 2.816999999999998 | 0 |  |  |
| 2.819999999999998 | 0 |  |  |
| 2.822999999999999 | 0 |  |  |
| 2.825999999999999 | 0 |  |  |
| 2.828999999999999 | 0 |  |  |
| 2.831999999999999 | 0 |  |  |
| 2.834999999999999 | 0 |  |  |
| 2.837999999999999 | 0 |  |  |
| 2.840999999999999 | 0 |  |  |
| 2.843999999999999 | 0 |  |  |
| 2.846999999999999 | 0 |  |  |
| 2.85 | 0 |  |  |
| 2.853 | 0 |  |  |
| 2.856 | 0 |  |  |
| 2.859 | 0 |  |  |
| 2.862 | 0 |  |  |
| 2.865 | 0 |  |  |
| 2.868 | 0 |  |  |
| 2.871 | 0 |  |  |
| 2.874000000000001 | 0 |  |  |
| 2.877000000000001 | 0 |  |  |
| 2.880000000000001 | 0 |  |  |
| 2.883000000000001 | 0 |  |  |
| 2.886000000000001 | 0 |  |  |
| 2.889000000000001 | 0 |  |  |
| 2.892000000000001 | 0 |  |  |
| 2.895000000000001 | 0 |  |  |
| 2.898000000000001 | 0 |  |  |
| 2.901000000000002 | 0 |  |  |
| 2.904000000000002 | 0 |  |  |
| 2.907000000000002 | 0 |  |  |
| 2.910000000000002 | 0 |  |  |
| 2.913000000000002 | 0 |  |  |
| 2.916000000000002 | 0 |  |  |
| 2.919000000000002 | 0 |  |  |
| 2.922000000000002 | 0 |  |  |
| 2.925000000000002 | 0 |  |  |
| 2.928000000000003 | 0 |  |  |
| 2.931000000000003 | 0 |  |  |
| 2.934000000000003 | 0 |  |  |
| 2.937000000000003 | 0 |  |  |
| 2.940000000000003 | 0 |  |  |
| 2.943000000000003 | 0 |  |  |
| 2.946000000000003 | 0 |  |  |
| 2.949000000000003 | 0 |  |  |
| 2.952000000000003 | 0 |  |  |
| 2.955000000000004 | 0 |  |  |
| 2.958000000000004 | 0 |  |  |
| 2.961000000000004 | 0 |  |  |
| 2.964000000000004 | 0 |  |  |
| 2.967000000000004 | 0 |  |  |
| 2.970000000000004 | 0 |  |  |
| 2.973000000000004 | 0 |  |  |
| 2.976000000000004 | 0 |  |  |
| 2.979000000000005 | 0 |  |  |
| 2.982000000000005 | 0 |  |  |
| 2.985000000000005 | 0 |  |  |
| 2.988000000000005 | 0 |  |  |
| 2.991000000000005 | 0 |  |  |
| 2.994000000000005 | 0 |  |  |
| 2.997000000000005 | 0 |  |  |
| 3.000000000000005 | 0 |  |  |